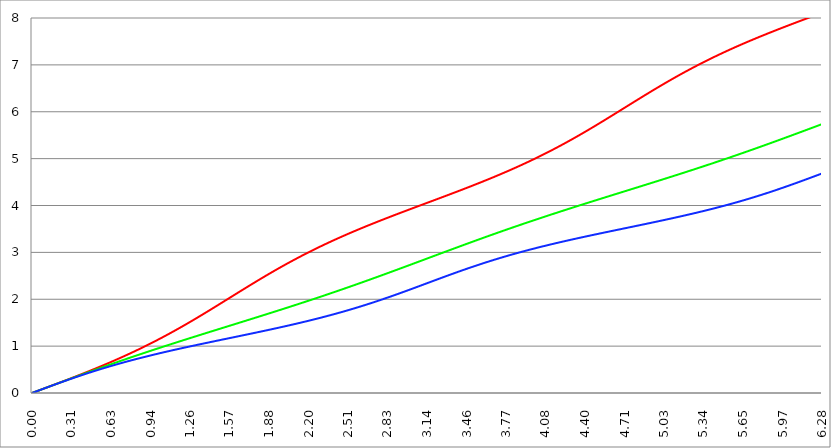
| Category | Series 1 | Series 0 | Series 2 |
|---|---|---|---|
| 0.0 | 0 | 0 | 0 |
| 0.00314159265358979 | 0.003 | 0.003 | 0.003 |
| 0.00628318530717958 | 0.006 | 0.006 | 0.006 |
| 0.00942477796076938 | 0.009 | 0.009 | 0.009 |
| 0.0125663706143592 | 0.013 | 0.013 | 0.013 |
| 0.015707963267949 | 0.016 | 0.016 | 0.016 |
| 0.0188495559215388 | 0.019 | 0.019 | 0.019 |
| 0.0219911485751285 | 0.022 | 0.022 | 0.022 |
| 0.0251327412287183 | 0.025 | 0.025 | 0.025 |
| 0.0282743338823081 | 0.028 | 0.028 | 0.028 |
| 0.0314159265358979 | 0.031 | 0.031 | 0.031 |
| 0.0345575191894877 | 0.035 | 0.035 | 0.035 |
| 0.0376991118430775 | 0.038 | 0.038 | 0.038 |
| 0.0408407044966673 | 0.041 | 0.041 | 0.041 |
| 0.0439822971502571 | 0.044 | 0.044 | 0.044 |
| 0.0471238898038469 | 0.047 | 0.047 | 0.047 |
| 0.0502654824574367 | 0.05 | 0.05 | 0.05 |
| 0.0534070751110265 | 0.053 | 0.053 | 0.053 |
| 0.0565486677646163 | 0.057 | 0.057 | 0.057 |
| 0.059690260418206 | 0.06 | 0.06 | 0.06 |
| 0.0628318530717958 | 0.063 | 0.063 | 0.063 |
| 0.0659734457253856 | 0.066 | 0.066 | 0.066 |
| 0.0691150383789754 | 0.069 | 0.069 | 0.069 |
| 0.0722566310325652 | 0.072 | 0.072 | 0.072 |
| 0.075398223686155 | 0.075 | 0.075 | 0.075 |
| 0.0785398163397448 | 0.079 | 0.079 | 0.078 |
| 0.0816814089933346 | 0.082 | 0.082 | 0.082 |
| 0.0848230016469244 | 0.085 | 0.085 | 0.085 |
| 0.0879645943005142 | 0.088 | 0.088 | 0.088 |
| 0.091106186954104 | 0.091 | 0.091 | 0.091 |
| 0.0942477796076937 | 0.094 | 0.094 | 0.094 |
| 0.0973893722612835 | 0.098 | 0.097 | 0.097 |
| 0.100530964914873 | 0.101 | 0.1 | 0.1 |
| 0.103672557568463 | 0.104 | 0.104 | 0.103 |
| 0.106814150222053 | 0.107 | 0.107 | 0.106 |
| 0.109955742875643 | 0.11 | 0.11 | 0.11 |
| 0.113097335529233 | 0.113 | 0.113 | 0.113 |
| 0.116238928182822 | 0.116 | 0.116 | 0.116 |
| 0.119380520836412 | 0.12 | 0.119 | 0.119 |
| 0.122522113490002 | 0.123 | 0.122 | 0.122 |
| 0.125663706143592 | 0.126 | 0.126 | 0.125 |
| 0.128805298797181 | 0.129 | 0.129 | 0.128 |
| 0.131946891450771 | 0.132 | 0.132 | 0.131 |
| 0.135088484104361 | 0.135 | 0.135 | 0.134 |
| 0.138230076757951 | 0.139 | 0.138 | 0.138 |
| 0.141371669411541 | 0.142 | 0.141 | 0.141 |
| 0.14451326206513 | 0.145 | 0.144 | 0.144 |
| 0.14765485471872 | 0.148 | 0.147 | 0.147 |
| 0.15079644737231 | 0.151 | 0.151 | 0.15 |
| 0.1539380400259 | 0.154 | 0.154 | 0.153 |
| 0.15707963267949 | 0.158 | 0.157 | 0.156 |
| 0.160221225333079 | 0.161 | 0.16 | 0.159 |
| 0.163362817986669 | 0.164 | 0.163 | 0.162 |
| 0.166504410640259 | 0.167 | 0.166 | 0.165 |
| 0.169646003293849 | 0.17 | 0.169 | 0.168 |
| 0.172787595947439 | 0.173 | 0.172 | 0.171 |
| 0.175929188601028 | 0.177 | 0.176 | 0.175 |
| 0.179070781254618 | 0.18 | 0.179 | 0.178 |
| 0.182212373908208 | 0.183 | 0.182 | 0.181 |
| 0.185353966561798 | 0.186 | 0.185 | 0.184 |
| 0.188495559215388 | 0.189 | 0.188 | 0.187 |
| 0.191637151868977 | 0.193 | 0.191 | 0.19 |
| 0.194778744522567 | 0.196 | 0.194 | 0.193 |
| 0.197920337176157 | 0.199 | 0.197 | 0.196 |
| 0.201061929829747 | 0.202 | 0.201 | 0.199 |
| 0.204203522483336 | 0.205 | 0.204 | 0.202 |
| 0.207345115136926 | 0.209 | 0.207 | 0.205 |
| 0.210486707790516 | 0.212 | 0.21 | 0.208 |
| 0.213628300444106 | 0.215 | 0.213 | 0.211 |
| 0.216769893097696 | 0.218 | 0.216 | 0.214 |
| 0.219911485751285 | 0.221 | 0.219 | 0.217 |
| 0.223053078404875 | 0.225 | 0.222 | 0.22 |
| 0.226194671058465 | 0.228 | 0.225 | 0.223 |
| 0.229336263712055 | 0.231 | 0.229 | 0.226 |
| 0.232477856365645 | 0.234 | 0.232 | 0.229 |
| 0.235619449019234 | 0.237 | 0.235 | 0.232 |
| 0.238761041672824 | 0.241 | 0.238 | 0.235 |
| 0.241902634326414 | 0.244 | 0.241 | 0.238 |
| 0.245044226980004 | 0.247 | 0.244 | 0.241 |
| 0.248185819633594 | 0.25 | 0.247 | 0.244 |
| 0.251327412287183 | 0.253 | 0.25 | 0.247 |
| 0.254469004940773 | 0.257 | 0.253 | 0.25 |
| 0.257610597594363 | 0.26 | 0.256 | 0.253 |
| 0.260752190247953 | 0.263 | 0.26 | 0.256 |
| 0.263893782901543 | 0.266 | 0.263 | 0.259 |
| 0.267035375555132 | 0.27 | 0.266 | 0.262 |
| 0.270176968208722 | 0.273 | 0.269 | 0.265 |
| 0.273318560862312 | 0.276 | 0.272 | 0.268 |
| 0.276460153515902 | 0.279 | 0.275 | 0.271 |
| 0.279601746169492 | 0.283 | 0.278 | 0.274 |
| 0.282743338823082 | 0.286 | 0.281 | 0.277 |
| 0.285884931476671 | 0.289 | 0.284 | 0.28 |
| 0.289026524130261 | 0.292 | 0.287 | 0.283 |
| 0.292168116783851 | 0.296 | 0.291 | 0.286 |
| 0.295309709437441 | 0.299 | 0.294 | 0.289 |
| 0.298451302091031 | 0.302 | 0.297 | 0.292 |
| 0.30159289474462 | 0.305 | 0.3 | 0.295 |
| 0.30473448739821 | 0.309 | 0.303 | 0.298 |
| 0.3078760800518 | 0.312 | 0.306 | 0.301 |
| 0.31101767270539 | 0.315 | 0.309 | 0.303 |
| 0.31415926535898 | 0.318 | 0.312 | 0.306 |
| 0.31730085801257 | 0.322 | 0.315 | 0.309 |
| 0.320442450666159 | 0.325 | 0.318 | 0.312 |
| 0.323584043319749 | 0.328 | 0.321 | 0.315 |
| 0.326725635973339 | 0.331 | 0.324 | 0.318 |
| 0.329867228626929 | 0.335 | 0.328 | 0.321 |
| 0.333008821280519 | 0.338 | 0.331 | 0.324 |
| 0.336150413934108 | 0.341 | 0.334 | 0.327 |
| 0.339292006587698 | 0.345 | 0.337 | 0.33 |
| 0.342433599241288 | 0.348 | 0.34 | 0.333 |
| 0.345575191894878 | 0.351 | 0.343 | 0.335 |
| 0.348716784548468 | 0.354 | 0.346 | 0.338 |
| 0.351858377202058 | 0.358 | 0.349 | 0.341 |
| 0.354999969855647 | 0.361 | 0.352 | 0.344 |
| 0.358141562509237 | 0.364 | 0.355 | 0.347 |
| 0.361283155162827 | 0.368 | 0.358 | 0.35 |
| 0.364424747816417 | 0.371 | 0.361 | 0.353 |
| 0.367566340470007 | 0.374 | 0.364 | 0.355 |
| 0.370707933123597 | 0.378 | 0.367 | 0.358 |
| 0.373849525777186 | 0.381 | 0.371 | 0.361 |
| 0.376991118430776 | 0.384 | 0.374 | 0.364 |
| 0.380132711084366 | 0.387 | 0.377 | 0.367 |
| 0.383274303737956 | 0.391 | 0.38 | 0.37 |
| 0.386415896391546 | 0.394 | 0.383 | 0.372 |
| 0.389557489045135 | 0.397 | 0.386 | 0.375 |
| 0.392699081698725 | 0.401 | 0.389 | 0.378 |
| 0.395840674352315 | 0.404 | 0.392 | 0.381 |
| 0.398982267005905 | 0.407 | 0.395 | 0.384 |
| 0.402123859659495 | 0.411 | 0.398 | 0.386 |
| 0.405265452313085 | 0.414 | 0.401 | 0.389 |
| 0.408407044966674 | 0.418 | 0.404 | 0.392 |
| 0.411548637620264 | 0.421 | 0.407 | 0.395 |
| 0.414690230273854 | 0.424 | 0.41 | 0.398 |
| 0.417831822927444 | 0.428 | 0.413 | 0.4 |
| 0.420973415581034 | 0.431 | 0.416 | 0.403 |
| 0.424115008234623 | 0.434 | 0.419 | 0.406 |
| 0.427256600888213 | 0.438 | 0.422 | 0.409 |
| 0.430398193541803 | 0.441 | 0.425 | 0.411 |
| 0.433539786195393 | 0.444 | 0.428 | 0.414 |
| 0.436681378848983 | 0.448 | 0.431 | 0.417 |
| 0.439822971502573 | 0.451 | 0.434 | 0.42 |
| 0.442964564156162 | 0.455 | 0.438 | 0.422 |
| 0.446106156809752 | 0.458 | 0.441 | 0.425 |
| 0.449247749463342 | 0.461 | 0.444 | 0.428 |
| 0.452389342116932 | 0.465 | 0.447 | 0.431 |
| 0.455530934770522 | 0.468 | 0.45 | 0.433 |
| 0.458672527424111 | 0.472 | 0.453 | 0.436 |
| 0.461814120077701 | 0.475 | 0.456 | 0.439 |
| 0.464955712731291 | 0.478 | 0.459 | 0.442 |
| 0.468097305384881 | 0.482 | 0.462 | 0.444 |
| 0.471238898038471 | 0.485 | 0.465 | 0.447 |
| 0.474380490692061 | 0.489 | 0.468 | 0.45 |
| 0.47752208334565 | 0.492 | 0.471 | 0.452 |
| 0.48066367599924 | 0.496 | 0.474 | 0.455 |
| 0.48380526865283 | 0.499 | 0.477 | 0.458 |
| 0.48694686130642 | 0.502 | 0.48 | 0.46 |
| 0.49008845396001 | 0.506 | 0.483 | 0.463 |
| 0.493230046613599 | 0.509 | 0.486 | 0.466 |
| 0.496371639267189 | 0.513 | 0.489 | 0.468 |
| 0.499513231920779 | 0.516 | 0.492 | 0.471 |
| 0.502654824574369 | 0.52 | 0.495 | 0.474 |
| 0.505796417227959 | 0.523 | 0.498 | 0.476 |
| 0.508938009881549 | 0.527 | 0.501 | 0.479 |
| 0.512079602535138 | 0.53 | 0.504 | 0.482 |
| 0.515221195188728 | 0.534 | 0.507 | 0.484 |
| 0.518362787842318 | 0.537 | 0.51 | 0.487 |
| 0.521504380495908 | 0.541 | 0.513 | 0.489 |
| 0.524645973149498 | 0.544 | 0.516 | 0.492 |
| 0.527787565803087 | 0.548 | 0.519 | 0.495 |
| 0.530929158456677 | 0.551 | 0.522 | 0.497 |
| 0.534070751110267 | 0.555 | 0.525 | 0.5 |
| 0.537212343763857 | 0.558 | 0.528 | 0.503 |
| 0.540353936417447 | 0.562 | 0.531 | 0.505 |
| 0.543495529071037 | 0.565 | 0.534 | 0.508 |
| 0.546637121724626 | 0.569 | 0.537 | 0.51 |
| 0.549778714378216 | 0.572 | 0.54 | 0.513 |
| 0.552920307031806 | 0.576 | 0.543 | 0.515 |
| 0.556061899685396 | 0.579 | 0.546 | 0.518 |
| 0.559203492338986 | 0.583 | 0.549 | 0.521 |
| 0.562345084992576 | 0.586 | 0.552 | 0.523 |
| 0.565486677646165 | 0.59 | 0.555 | 0.526 |
| 0.568628270299755 | 0.593 | 0.558 | 0.528 |
| 0.571769862953345 | 0.597 | 0.56 | 0.531 |
| 0.574911455606935 | 0.601 | 0.563 | 0.533 |
| 0.578053048260525 | 0.604 | 0.566 | 0.536 |
| 0.581194640914114 | 0.608 | 0.569 | 0.538 |
| 0.584336233567704 | 0.611 | 0.572 | 0.541 |
| 0.587477826221294 | 0.615 | 0.575 | 0.543 |
| 0.590619418874884 | 0.618 | 0.578 | 0.546 |
| 0.593761011528474 | 0.622 | 0.581 | 0.549 |
| 0.596902604182064 | 0.626 | 0.584 | 0.551 |
| 0.600044196835653 | 0.629 | 0.587 | 0.554 |
| 0.603185789489243 | 0.633 | 0.59 | 0.556 |
| 0.606327382142833 | 0.636 | 0.593 | 0.559 |
| 0.609468974796423 | 0.64 | 0.596 | 0.561 |
| 0.612610567450013 | 0.644 | 0.599 | 0.564 |
| 0.615752160103602 | 0.647 | 0.602 | 0.566 |
| 0.618893752757192 | 0.651 | 0.605 | 0.568 |
| 0.622035345410782 | 0.654 | 0.608 | 0.571 |
| 0.625176938064372 | 0.658 | 0.611 | 0.573 |
| 0.628318530717962 | 0.662 | 0.614 | 0.576 |
| 0.631460123371551 | 0.665 | 0.617 | 0.578 |
| 0.634601716025141 | 0.669 | 0.62 | 0.581 |
| 0.637743308678731 | 0.673 | 0.622 | 0.583 |
| 0.640884901332321 | 0.676 | 0.625 | 0.586 |
| 0.644026493985911 | 0.68 | 0.628 | 0.588 |
| 0.647168086639501 | 0.684 | 0.631 | 0.591 |
| 0.65030967929309 | 0.687 | 0.634 | 0.593 |
| 0.65345127194668 | 0.691 | 0.637 | 0.595 |
| 0.65659286460027 | 0.695 | 0.64 | 0.598 |
| 0.65973445725386 | 0.698 | 0.643 | 0.6 |
| 0.66287604990745 | 0.702 | 0.646 | 0.603 |
| 0.666017642561039 | 0.706 | 0.649 | 0.605 |
| 0.669159235214629 | 0.71 | 0.652 | 0.607 |
| 0.672300827868219 | 0.713 | 0.655 | 0.61 |
| 0.675442420521809 | 0.717 | 0.658 | 0.612 |
| 0.678584013175399 | 0.721 | 0.66 | 0.615 |
| 0.681725605828989 | 0.724 | 0.663 | 0.617 |
| 0.684867198482578 | 0.728 | 0.666 | 0.619 |
| 0.688008791136168 | 0.732 | 0.669 | 0.622 |
| 0.691150383789758 | 0.736 | 0.672 | 0.624 |
| 0.694291976443348 | 0.739 | 0.675 | 0.627 |
| 0.697433569096938 | 0.743 | 0.678 | 0.629 |
| 0.700575161750528 | 0.747 | 0.681 | 0.631 |
| 0.703716754404117 | 0.751 | 0.684 | 0.634 |
| 0.706858347057707 | 0.755 | 0.687 | 0.636 |
| 0.709999939711297 | 0.758 | 0.69 | 0.638 |
| 0.713141532364887 | 0.762 | 0.692 | 0.641 |
| 0.716283125018477 | 0.766 | 0.695 | 0.643 |
| 0.719424717672066 | 0.77 | 0.698 | 0.645 |
| 0.722566310325656 | 0.774 | 0.701 | 0.648 |
| 0.725707902979246 | 0.777 | 0.704 | 0.65 |
| 0.728849495632836 | 0.781 | 0.707 | 0.652 |
| 0.731991088286426 | 0.785 | 0.71 | 0.655 |
| 0.735132680940016 | 0.789 | 0.713 | 0.657 |
| 0.738274273593605 | 0.793 | 0.715 | 0.659 |
| 0.741415866247195 | 0.796 | 0.718 | 0.662 |
| 0.744557458900785 | 0.8 | 0.721 | 0.664 |
| 0.747699051554375 | 0.804 | 0.724 | 0.666 |
| 0.750840644207965 | 0.808 | 0.727 | 0.668 |
| 0.753982236861554 | 0.812 | 0.73 | 0.671 |
| 0.757123829515144 | 0.816 | 0.733 | 0.673 |
| 0.760265422168734 | 0.82 | 0.736 | 0.675 |
| 0.763407014822324 | 0.824 | 0.738 | 0.678 |
| 0.766548607475914 | 0.827 | 0.741 | 0.68 |
| 0.769690200129504 | 0.831 | 0.744 | 0.682 |
| 0.772831792783093 | 0.835 | 0.747 | 0.684 |
| 0.775973385436683 | 0.839 | 0.75 | 0.687 |
| 0.779114978090273 | 0.843 | 0.753 | 0.689 |
| 0.782256570743863 | 0.847 | 0.756 | 0.691 |
| 0.785398163397453 | 0.851 | 0.759 | 0.693 |
| 0.788539756051042 | 0.855 | 0.761 | 0.696 |
| 0.791681348704632 | 0.859 | 0.764 | 0.698 |
| 0.794822941358222 | 0.863 | 0.767 | 0.7 |
| 0.797964534011812 | 0.867 | 0.77 | 0.702 |
| 0.801106126665402 | 0.871 | 0.773 | 0.705 |
| 0.804247719318992 | 0.875 | 0.776 | 0.707 |
| 0.807389311972581 | 0.878 | 0.778 | 0.709 |
| 0.810530904626171 | 0.882 | 0.781 | 0.711 |
| 0.813672497279761 | 0.886 | 0.784 | 0.713 |
| 0.816814089933351 | 0.89 | 0.787 | 0.716 |
| 0.819955682586941 | 0.894 | 0.79 | 0.718 |
| 0.823097275240531 | 0.898 | 0.793 | 0.72 |
| 0.82623886789412 | 0.902 | 0.796 | 0.722 |
| 0.82938046054771 | 0.906 | 0.798 | 0.724 |
| 0.8325220532013 | 0.91 | 0.801 | 0.727 |
| 0.83566364585489 | 0.914 | 0.804 | 0.729 |
| 0.83880523850848 | 0.919 | 0.807 | 0.731 |
| 0.841946831162069 | 0.923 | 0.81 | 0.733 |
| 0.845088423815659 | 0.927 | 0.812 | 0.735 |
| 0.848230016469249 | 0.931 | 0.815 | 0.737 |
| 0.851371609122839 | 0.935 | 0.818 | 0.74 |
| 0.854513201776429 | 0.939 | 0.821 | 0.742 |
| 0.857654794430019 | 0.943 | 0.824 | 0.744 |
| 0.860796387083608 | 0.947 | 0.827 | 0.746 |
| 0.863937979737198 | 0.951 | 0.829 | 0.748 |
| 0.867079572390788 | 0.955 | 0.832 | 0.75 |
| 0.870221165044378 | 0.959 | 0.835 | 0.753 |
| 0.873362757697968 | 0.963 | 0.838 | 0.755 |
| 0.876504350351557 | 0.967 | 0.841 | 0.757 |
| 0.879645943005147 | 0.972 | 0.843 | 0.759 |
| 0.882787535658737 | 0.976 | 0.846 | 0.761 |
| 0.885929128312327 | 0.98 | 0.849 | 0.763 |
| 0.889070720965917 | 0.984 | 0.852 | 0.765 |
| 0.892212313619507 | 0.988 | 0.855 | 0.767 |
| 0.895353906273096 | 0.992 | 0.857 | 0.77 |
| 0.898495498926686 | 0.996 | 0.86 | 0.772 |
| 0.901637091580276 | 1.001 | 0.863 | 0.774 |
| 0.904778684233866 | 1.005 | 0.866 | 0.776 |
| 0.907920276887456 | 1.009 | 0.869 | 0.778 |
| 0.911061869541045 | 1.013 | 0.871 | 0.78 |
| 0.914203462194635 | 1.017 | 0.874 | 0.782 |
| 0.917345054848225 | 1.021 | 0.877 | 0.784 |
| 0.920486647501815 | 1.026 | 0.88 | 0.786 |
| 0.923628240155405 | 1.03 | 0.883 | 0.788 |
| 0.926769832808995 | 1.034 | 0.885 | 0.791 |
| 0.929911425462584 | 1.038 | 0.888 | 0.793 |
| 0.933053018116174 | 1.043 | 0.891 | 0.795 |
| 0.936194610769764 | 1.047 | 0.894 | 0.797 |
| 0.939336203423354 | 1.051 | 0.897 | 0.799 |
| 0.942477796076944 | 1.055 | 0.899 | 0.801 |
| 0.945619388730533 | 1.06 | 0.902 | 0.803 |
| 0.948760981384123 | 1.064 | 0.905 | 0.805 |
| 0.951902574037713 | 1.068 | 0.908 | 0.807 |
| 0.955044166691303 | 1.072 | 0.91 | 0.809 |
| 0.958185759344893 | 1.077 | 0.913 | 0.811 |
| 0.961327351998483 | 1.081 | 0.916 | 0.813 |
| 0.964468944652072 | 1.085 | 0.919 | 0.815 |
| 0.967610537305662 | 1.09 | 0.922 | 0.817 |
| 0.970752129959252 | 1.094 | 0.924 | 0.819 |
| 0.973893722612842 | 1.098 | 0.927 | 0.821 |
| 0.977035315266432 | 1.102 | 0.93 | 0.823 |
| 0.980176907920022 | 1.107 | 0.933 | 0.825 |
| 0.983318500573611 | 1.111 | 0.935 | 0.827 |
| 0.986460093227201 | 1.116 | 0.938 | 0.829 |
| 0.989601685880791 | 1.12 | 0.941 | 0.831 |
| 0.992743278534381 | 1.124 | 0.944 | 0.833 |
| 0.995884871187971 | 1.129 | 0.946 | 0.835 |
| 0.99902646384156 | 1.133 | 0.949 | 0.837 |
| 1.00216805649515 | 1.137 | 0.952 | 0.839 |
| 1.00530964914874 | 1.142 | 0.955 | 0.841 |
| 1.00845124180233 | 1.146 | 0.957 | 0.843 |
| 1.01159283445592 | 1.151 | 0.96 | 0.845 |
| 1.01473442710951 | 1.155 | 0.963 | 0.847 |
| 1.017876019763099 | 1.159 | 0.966 | 0.849 |
| 1.021017612416689 | 1.164 | 0.968 | 0.851 |
| 1.02415920507028 | 1.168 | 0.971 | 0.853 |
| 1.027300797723869 | 1.173 | 0.974 | 0.855 |
| 1.030442390377459 | 1.177 | 0.977 | 0.857 |
| 1.033583983031048 | 1.182 | 0.979 | 0.859 |
| 1.036725575684638 | 1.186 | 0.982 | 0.861 |
| 1.039867168338228 | 1.191 | 0.985 | 0.863 |
| 1.043008760991818 | 1.195 | 0.988 | 0.865 |
| 1.046150353645408 | 1.199 | 0.99 | 0.867 |
| 1.049291946298998 | 1.204 | 0.993 | 0.869 |
| 1.052433538952587 | 1.208 | 0.996 | 0.871 |
| 1.055575131606177 | 1.213 | 0.998 | 0.873 |
| 1.058716724259767 | 1.217 | 1.001 | 0.875 |
| 1.061858316913357 | 1.222 | 1.004 | 0.877 |
| 1.064999909566947 | 1.227 | 1.007 | 0.879 |
| 1.068141502220536 | 1.231 | 1.009 | 0.881 |
| 1.071283094874126 | 1.236 | 1.012 | 0.883 |
| 1.074424687527716 | 1.24 | 1.015 | 0.885 |
| 1.077566280181306 | 1.245 | 1.017 | 0.887 |
| 1.080707872834896 | 1.249 | 1.02 | 0.889 |
| 1.083849465488486 | 1.254 | 1.023 | 0.891 |
| 1.086991058142075 | 1.258 | 1.026 | 0.893 |
| 1.090132650795665 | 1.263 | 1.028 | 0.894 |
| 1.093274243449255 | 1.268 | 1.031 | 0.896 |
| 1.096415836102845 | 1.272 | 1.034 | 0.898 |
| 1.099557428756435 | 1.277 | 1.037 | 0.9 |
| 1.102699021410025 | 1.281 | 1.039 | 0.902 |
| 1.105840614063614 | 1.286 | 1.042 | 0.904 |
| 1.108982206717204 | 1.291 | 1.045 | 0.906 |
| 1.112123799370794 | 1.295 | 1.047 | 0.908 |
| 1.115265392024384 | 1.3 | 1.05 | 0.91 |
| 1.118406984677974 | 1.304 | 1.053 | 0.912 |
| 1.121548577331563 | 1.309 | 1.055 | 0.914 |
| 1.124690169985153 | 1.314 | 1.058 | 0.916 |
| 1.127831762638743 | 1.318 | 1.061 | 0.917 |
| 1.130973355292333 | 1.323 | 1.064 | 0.919 |
| 1.134114947945923 | 1.328 | 1.066 | 0.921 |
| 1.137256540599513 | 1.332 | 1.069 | 0.923 |
| 1.140398133253102 | 1.337 | 1.072 | 0.925 |
| 1.143539725906692 | 1.342 | 1.074 | 0.927 |
| 1.146681318560282 | 1.347 | 1.077 | 0.929 |
| 1.149822911213872 | 1.351 | 1.08 | 0.931 |
| 1.152964503867462 | 1.356 | 1.082 | 0.933 |
| 1.156106096521051 | 1.361 | 1.085 | 0.934 |
| 1.159247689174641 | 1.365 | 1.088 | 0.936 |
| 1.162389281828231 | 1.37 | 1.09 | 0.938 |
| 1.165530874481821 | 1.375 | 1.093 | 0.94 |
| 1.168672467135411 | 1.38 | 1.096 | 0.942 |
| 1.171814059789001 | 1.384 | 1.099 | 0.944 |
| 1.17495565244259 | 1.389 | 1.101 | 0.946 |
| 1.17809724509618 | 1.394 | 1.104 | 0.948 |
| 1.18123883774977 | 1.399 | 1.107 | 0.949 |
| 1.18438043040336 | 1.403 | 1.109 | 0.951 |
| 1.18752202305695 | 1.408 | 1.112 | 0.953 |
| 1.190663615710539 | 1.413 | 1.115 | 0.955 |
| 1.193805208364129 | 1.418 | 1.117 | 0.957 |
| 1.19694680101772 | 1.423 | 1.12 | 0.959 |
| 1.200088393671309 | 1.427 | 1.123 | 0.961 |
| 1.203229986324899 | 1.432 | 1.125 | 0.962 |
| 1.206371578978489 | 1.437 | 1.128 | 0.964 |
| 1.209513171632078 | 1.442 | 1.131 | 0.966 |
| 1.212654764285668 | 1.447 | 1.133 | 0.968 |
| 1.215796356939258 | 1.452 | 1.136 | 0.97 |
| 1.218937949592848 | 1.456 | 1.139 | 0.972 |
| 1.222079542246438 | 1.461 | 1.141 | 0.974 |
| 1.225221134900027 | 1.466 | 1.144 | 0.975 |
| 1.228362727553617 | 1.471 | 1.147 | 0.977 |
| 1.231504320207207 | 1.476 | 1.149 | 0.979 |
| 1.234645912860797 | 1.481 | 1.152 | 0.981 |
| 1.237787505514387 | 1.486 | 1.155 | 0.983 |
| 1.240929098167977 | 1.491 | 1.157 | 0.985 |
| 1.244070690821566 | 1.495 | 1.16 | 0.986 |
| 1.247212283475156 | 1.5 | 1.163 | 0.988 |
| 1.250353876128746 | 1.505 | 1.165 | 0.99 |
| 1.253495468782336 | 1.51 | 1.168 | 0.992 |
| 1.256637061435926 | 1.515 | 1.171 | 0.994 |
| 1.259778654089515 | 1.52 | 1.173 | 0.996 |
| 1.262920246743105 | 1.525 | 1.176 | 0.997 |
| 1.266061839396695 | 1.53 | 1.179 | 0.999 |
| 1.269203432050285 | 1.535 | 1.181 | 1.001 |
| 1.272345024703875 | 1.54 | 1.184 | 1.003 |
| 1.275486617357465 | 1.545 | 1.187 | 1.005 |
| 1.278628210011054 | 1.55 | 1.189 | 1.006 |
| 1.281769802664644 | 1.555 | 1.192 | 1.008 |
| 1.284911395318234 | 1.56 | 1.195 | 1.01 |
| 1.288052987971824 | 1.565 | 1.197 | 1.012 |
| 1.291194580625414 | 1.57 | 1.2 | 1.014 |
| 1.294336173279003 | 1.575 | 1.203 | 1.015 |
| 1.297477765932593 | 1.58 | 1.205 | 1.017 |
| 1.300619358586183 | 1.585 | 1.208 | 1.019 |
| 1.303760951239773 | 1.59 | 1.211 | 1.021 |
| 1.306902543893363 | 1.595 | 1.213 | 1.023 |
| 1.310044136546953 | 1.6 | 1.216 | 1.024 |
| 1.313185729200542 | 1.605 | 1.218 | 1.026 |
| 1.316327321854132 | 1.61 | 1.221 | 1.028 |
| 1.319468914507722 | 1.615 | 1.224 | 1.03 |
| 1.322610507161312 | 1.62 | 1.226 | 1.032 |
| 1.325752099814902 | 1.625 | 1.229 | 1.033 |
| 1.328893692468491 | 1.63 | 1.232 | 1.035 |
| 1.332035285122081 | 1.635 | 1.234 | 1.037 |
| 1.335176877775671 | 1.64 | 1.237 | 1.039 |
| 1.338318470429261 | 1.645 | 1.24 | 1.041 |
| 1.341460063082851 | 1.65 | 1.242 | 1.042 |
| 1.344601655736441 | 1.655 | 1.245 | 1.044 |
| 1.34774324839003 | 1.66 | 1.248 | 1.046 |
| 1.35088484104362 | 1.665 | 1.25 | 1.048 |
| 1.35402643369721 | 1.67 | 1.253 | 1.05 |
| 1.3571680263508 | 1.675 | 1.255 | 1.051 |
| 1.36030961900439 | 1.68 | 1.258 | 1.053 |
| 1.363451211657979 | 1.686 | 1.261 | 1.055 |
| 1.36659280431157 | 1.691 | 1.263 | 1.057 |
| 1.369734396965159 | 1.696 | 1.266 | 1.058 |
| 1.372875989618749 | 1.701 | 1.269 | 1.06 |
| 1.376017582272339 | 1.706 | 1.271 | 1.062 |
| 1.379159174925929 | 1.711 | 1.274 | 1.064 |
| 1.382300767579518 | 1.716 | 1.277 | 1.066 |
| 1.385442360233108 | 1.721 | 1.279 | 1.067 |
| 1.388583952886698 | 1.726 | 1.282 | 1.069 |
| 1.391725545540288 | 1.732 | 1.284 | 1.071 |
| 1.394867138193878 | 1.737 | 1.287 | 1.073 |
| 1.398008730847468 | 1.742 | 1.29 | 1.074 |
| 1.401150323501057 | 1.747 | 1.292 | 1.076 |
| 1.404291916154647 | 1.752 | 1.295 | 1.078 |
| 1.407433508808237 | 1.757 | 1.298 | 1.08 |
| 1.410575101461827 | 1.762 | 1.3 | 1.081 |
| 1.413716694115417 | 1.768 | 1.303 | 1.083 |
| 1.416858286769006 | 1.773 | 1.305 | 1.085 |
| 1.419999879422596 | 1.778 | 1.308 | 1.087 |
| 1.423141472076186 | 1.783 | 1.311 | 1.089 |
| 1.426283064729776 | 1.788 | 1.313 | 1.09 |
| 1.429424657383366 | 1.793 | 1.316 | 1.092 |
| 1.432566250036956 | 1.798 | 1.319 | 1.094 |
| 1.435707842690545 | 1.804 | 1.321 | 1.096 |
| 1.438849435344135 | 1.809 | 1.324 | 1.097 |
| 1.441991027997725 | 1.814 | 1.326 | 1.099 |
| 1.445132620651315 | 1.819 | 1.329 | 1.101 |
| 1.448274213304905 | 1.824 | 1.332 | 1.103 |
| 1.451415805958494 | 1.83 | 1.334 | 1.104 |
| 1.454557398612084 | 1.835 | 1.337 | 1.106 |
| 1.457698991265674 | 1.84 | 1.34 | 1.108 |
| 1.460840583919264 | 1.845 | 1.342 | 1.11 |
| 1.463982176572854 | 1.85 | 1.345 | 1.111 |
| 1.467123769226444 | 1.856 | 1.347 | 1.113 |
| 1.470265361880033 | 1.861 | 1.35 | 1.115 |
| 1.473406954533623 | 1.866 | 1.353 | 1.117 |
| 1.476548547187213 | 1.871 | 1.355 | 1.118 |
| 1.479690139840803 | 1.876 | 1.358 | 1.12 |
| 1.482831732494393 | 1.882 | 1.361 | 1.122 |
| 1.485973325147982 | 1.887 | 1.363 | 1.124 |
| 1.489114917801572 | 1.892 | 1.366 | 1.125 |
| 1.492256510455162 | 1.897 | 1.368 | 1.127 |
| 1.495398103108752 | 1.902 | 1.371 | 1.129 |
| 1.498539695762342 | 1.908 | 1.374 | 1.131 |
| 1.501681288415932 | 1.913 | 1.376 | 1.132 |
| 1.504822881069521 | 1.918 | 1.379 | 1.134 |
| 1.507964473723111 | 1.923 | 1.382 | 1.136 |
| 1.511106066376701 | 1.928 | 1.384 | 1.138 |
| 1.514247659030291 | 1.934 | 1.387 | 1.139 |
| 1.517389251683881 | 1.939 | 1.389 | 1.141 |
| 1.520530844337471 | 1.944 | 1.392 | 1.143 |
| 1.52367243699106 | 1.949 | 1.395 | 1.145 |
| 1.52681402964465 | 1.955 | 1.397 | 1.146 |
| 1.52995562229824 | 1.96 | 1.4 | 1.148 |
| 1.53309721495183 | 1.965 | 1.403 | 1.15 |
| 1.53623880760542 | 1.97 | 1.405 | 1.152 |
| 1.539380400259009 | 1.976 | 1.408 | 1.153 |
| 1.542521992912599 | 1.981 | 1.41 | 1.155 |
| 1.545663585566189 | 1.986 | 1.413 | 1.157 |
| 1.548805178219779 | 1.991 | 1.416 | 1.159 |
| 1.551946770873369 | 1.996 | 1.418 | 1.16 |
| 1.555088363526959 | 2.002 | 1.421 | 1.162 |
| 1.558229956180548 | 2.007 | 1.423 | 1.164 |
| 1.561371548834138 | 2.012 | 1.426 | 1.166 |
| 1.564513141487728 | 2.017 | 1.429 | 1.167 |
| 1.567654734141318 | 2.023 | 1.431 | 1.169 |
| 1.570796326794908 | 2.028 | 1.434 | 1.171 |
| 1.573937919448497 | 2.033 | 1.437 | 1.173 |
| 1.577079512102087 | 2.038 | 1.439 | 1.174 |
| 1.580221104755677 | 2.044 | 1.442 | 1.176 |
| 1.583362697409267 | 2.049 | 1.444 | 1.178 |
| 1.586504290062857 | 2.054 | 1.447 | 1.18 |
| 1.589645882716447 | 2.059 | 1.45 | 1.181 |
| 1.592787475370036 | 2.065 | 1.452 | 1.183 |
| 1.595929068023626 | 2.07 | 1.455 | 1.185 |
| 1.599070660677216 | 2.075 | 1.457 | 1.187 |
| 1.602212253330806 | 2.08 | 1.46 | 1.188 |
| 1.605353845984396 | 2.085 | 1.463 | 1.19 |
| 1.608495438637985 | 2.091 | 1.465 | 1.192 |
| 1.611637031291575 | 2.096 | 1.468 | 1.193 |
| 1.614778623945165 | 2.101 | 1.471 | 1.195 |
| 1.617920216598755 | 2.106 | 1.473 | 1.197 |
| 1.621061809252345 | 2.112 | 1.476 | 1.199 |
| 1.624203401905935 | 2.117 | 1.478 | 1.2 |
| 1.627344994559524 | 2.122 | 1.481 | 1.202 |
| 1.630486587213114 | 2.127 | 1.484 | 1.204 |
| 1.633628179866704 | 2.133 | 1.486 | 1.206 |
| 1.636769772520294 | 2.138 | 1.489 | 1.207 |
| 1.639911365173884 | 2.143 | 1.492 | 1.209 |
| 1.643052957827473 | 2.148 | 1.494 | 1.211 |
| 1.646194550481063 | 2.153 | 1.497 | 1.213 |
| 1.649336143134653 | 2.159 | 1.499 | 1.214 |
| 1.652477735788243 | 2.164 | 1.502 | 1.216 |
| 1.655619328441833 | 2.169 | 1.505 | 1.218 |
| 1.658760921095423 | 2.174 | 1.507 | 1.22 |
| 1.661902513749012 | 2.179 | 1.51 | 1.221 |
| 1.665044106402602 | 2.185 | 1.513 | 1.223 |
| 1.668185699056192 | 2.19 | 1.515 | 1.225 |
| 1.671327291709782 | 2.195 | 1.518 | 1.227 |
| 1.674468884363372 | 2.2 | 1.52 | 1.228 |
| 1.677610477016961 | 2.205 | 1.523 | 1.23 |
| 1.680752069670551 | 2.211 | 1.526 | 1.232 |
| 1.683893662324141 | 2.216 | 1.528 | 1.234 |
| 1.687035254977731 | 2.221 | 1.531 | 1.236 |
| 1.690176847631321 | 2.226 | 1.533 | 1.237 |
| 1.693318440284911 | 2.231 | 1.536 | 1.239 |
| 1.6964600329385 | 2.237 | 1.539 | 1.241 |
| 1.69960162559209 | 2.242 | 1.541 | 1.243 |
| 1.70274321824568 | 2.247 | 1.544 | 1.244 |
| 1.70588481089927 | 2.252 | 1.547 | 1.246 |
| 1.70902640355286 | 2.257 | 1.549 | 1.248 |
| 1.712167996206449 | 2.262 | 1.552 | 1.25 |
| 1.715309588860039 | 2.268 | 1.555 | 1.251 |
| 1.71845118151363 | 2.273 | 1.557 | 1.253 |
| 1.721592774167219 | 2.278 | 1.56 | 1.255 |
| 1.724734366820809 | 2.283 | 1.562 | 1.257 |
| 1.727875959474399 | 2.288 | 1.565 | 1.258 |
| 1.731017552127988 | 2.293 | 1.568 | 1.26 |
| 1.734159144781578 | 2.299 | 1.57 | 1.262 |
| 1.737300737435168 | 2.304 | 1.573 | 1.264 |
| 1.740442330088758 | 2.309 | 1.576 | 1.265 |
| 1.743583922742348 | 2.314 | 1.578 | 1.267 |
| 1.746725515395937 | 2.319 | 1.581 | 1.269 |
| 1.749867108049527 | 2.324 | 1.583 | 1.271 |
| 1.753008700703117 | 2.329 | 1.586 | 1.273 |
| 1.756150293356707 | 2.335 | 1.589 | 1.274 |
| 1.759291886010297 | 2.34 | 1.591 | 1.276 |
| 1.762433478663887 | 2.345 | 1.594 | 1.278 |
| 1.765575071317476 | 2.35 | 1.597 | 1.28 |
| 1.768716663971066 | 2.355 | 1.599 | 1.281 |
| 1.771858256624656 | 2.36 | 1.602 | 1.283 |
| 1.774999849278246 | 2.365 | 1.604 | 1.285 |
| 1.778141441931836 | 2.37 | 1.607 | 1.287 |
| 1.781283034585426 | 2.375 | 1.61 | 1.289 |
| 1.784424627239015 | 2.38 | 1.612 | 1.29 |
| 1.787566219892605 | 2.386 | 1.615 | 1.292 |
| 1.790707812546195 | 2.391 | 1.618 | 1.294 |
| 1.793849405199785 | 2.396 | 1.62 | 1.296 |
| 1.796990997853375 | 2.401 | 1.623 | 1.297 |
| 1.800132590506964 | 2.406 | 1.626 | 1.299 |
| 1.803274183160554 | 2.411 | 1.628 | 1.301 |
| 1.806415775814144 | 2.416 | 1.631 | 1.303 |
| 1.809557368467734 | 2.421 | 1.634 | 1.305 |
| 1.812698961121324 | 2.426 | 1.636 | 1.306 |
| 1.815840553774914 | 2.431 | 1.639 | 1.308 |
| 1.818982146428503 | 2.436 | 1.641 | 1.31 |
| 1.822123739082093 | 2.441 | 1.644 | 1.312 |
| 1.825265331735683 | 2.446 | 1.647 | 1.314 |
| 1.828406924389273 | 2.451 | 1.649 | 1.315 |
| 1.831548517042863 | 2.456 | 1.652 | 1.317 |
| 1.834690109696452 | 2.461 | 1.655 | 1.319 |
| 1.837831702350042 | 2.466 | 1.657 | 1.321 |
| 1.840973295003632 | 2.471 | 1.66 | 1.323 |
| 1.844114887657222 | 2.476 | 1.663 | 1.324 |
| 1.847256480310812 | 2.481 | 1.665 | 1.326 |
| 1.850398072964402 | 2.486 | 1.668 | 1.328 |
| 1.853539665617991 | 2.491 | 1.671 | 1.33 |
| 1.856681258271581 | 2.496 | 1.673 | 1.332 |
| 1.859822850925171 | 2.501 | 1.676 | 1.333 |
| 1.862964443578761 | 2.506 | 1.679 | 1.335 |
| 1.866106036232351 | 2.511 | 1.681 | 1.337 |
| 1.86924762888594 | 2.516 | 1.684 | 1.339 |
| 1.87238922153953 | 2.521 | 1.687 | 1.341 |
| 1.87553081419312 | 2.526 | 1.689 | 1.342 |
| 1.87867240684671 | 2.531 | 1.692 | 1.344 |
| 1.8818139995003 | 2.536 | 1.694 | 1.346 |
| 1.88495559215389 | 2.541 | 1.697 | 1.348 |
| 1.888097184807479 | 2.546 | 1.7 | 1.35 |
| 1.891238777461069 | 2.55 | 1.702 | 1.352 |
| 1.89438037011466 | 2.555 | 1.705 | 1.353 |
| 1.897521962768249 | 2.56 | 1.708 | 1.355 |
| 1.900663555421839 | 2.565 | 1.71 | 1.357 |
| 1.903805148075429 | 2.57 | 1.713 | 1.359 |
| 1.906946740729018 | 2.575 | 1.716 | 1.361 |
| 1.910088333382608 | 2.58 | 1.718 | 1.363 |
| 1.913229926036198 | 2.585 | 1.721 | 1.364 |
| 1.916371518689788 | 2.59 | 1.724 | 1.366 |
| 1.919513111343378 | 2.594 | 1.726 | 1.368 |
| 1.922654703996967 | 2.599 | 1.729 | 1.37 |
| 1.925796296650557 | 2.604 | 1.732 | 1.372 |
| 1.928937889304147 | 2.609 | 1.734 | 1.374 |
| 1.932079481957737 | 2.614 | 1.737 | 1.375 |
| 1.935221074611327 | 2.619 | 1.74 | 1.377 |
| 1.938362667264917 | 2.623 | 1.743 | 1.379 |
| 1.941504259918506 | 2.628 | 1.745 | 1.381 |
| 1.944645852572096 | 2.633 | 1.748 | 1.383 |
| 1.947787445225686 | 2.638 | 1.751 | 1.385 |
| 1.950929037879276 | 2.643 | 1.753 | 1.387 |
| 1.954070630532866 | 2.648 | 1.756 | 1.388 |
| 1.957212223186455 | 2.652 | 1.759 | 1.39 |
| 1.960353815840045 | 2.657 | 1.761 | 1.392 |
| 1.963495408493635 | 2.662 | 1.764 | 1.394 |
| 1.966637001147225 | 2.667 | 1.767 | 1.396 |
| 1.969778593800815 | 2.671 | 1.769 | 1.398 |
| 1.972920186454405 | 2.676 | 1.772 | 1.4 |
| 1.976061779107994 | 2.681 | 1.775 | 1.401 |
| 1.979203371761584 | 2.686 | 1.777 | 1.403 |
| 1.982344964415174 | 2.69 | 1.78 | 1.405 |
| 1.985486557068764 | 2.695 | 1.783 | 1.407 |
| 1.988628149722354 | 2.7 | 1.785 | 1.409 |
| 1.991769742375943 | 2.705 | 1.788 | 1.411 |
| 1.994911335029533 | 2.709 | 1.791 | 1.413 |
| 1.998052927683123 | 2.714 | 1.794 | 1.415 |
| 2.001194520336712 | 2.719 | 1.796 | 1.417 |
| 2.004336112990302 | 2.723 | 1.799 | 1.418 |
| 2.007477705643892 | 2.728 | 1.802 | 1.42 |
| 2.010619298297482 | 2.733 | 1.804 | 1.422 |
| 2.013760890951071 | 2.737 | 1.807 | 1.424 |
| 2.016902483604661 | 2.742 | 1.81 | 1.426 |
| 2.02004407625825 | 2.747 | 1.812 | 1.428 |
| 2.02318566891184 | 2.751 | 1.815 | 1.43 |
| 2.02632726156543 | 2.756 | 1.818 | 1.432 |
| 2.029468854219019 | 2.761 | 1.821 | 1.434 |
| 2.032610446872609 | 2.765 | 1.823 | 1.436 |
| 2.035752039526198 | 2.77 | 1.826 | 1.437 |
| 2.038893632179788 | 2.774 | 1.829 | 1.439 |
| 2.042035224833378 | 2.779 | 1.831 | 1.441 |
| 2.045176817486967 | 2.784 | 1.834 | 1.443 |
| 2.048318410140557 | 2.788 | 1.837 | 1.445 |
| 2.051460002794146 | 2.793 | 1.84 | 1.447 |
| 2.054601595447736 | 2.797 | 1.842 | 1.449 |
| 2.057743188101325 | 2.802 | 1.845 | 1.451 |
| 2.060884780754915 | 2.807 | 1.848 | 1.453 |
| 2.064026373408505 | 2.811 | 1.85 | 1.455 |
| 2.067167966062094 | 2.816 | 1.853 | 1.457 |
| 2.070309558715684 | 2.82 | 1.856 | 1.459 |
| 2.073451151369273 | 2.825 | 1.859 | 1.461 |
| 2.076592744022863 | 2.829 | 1.861 | 1.463 |
| 2.079734336676452 | 2.834 | 1.864 | 1.465 |
| 2.082875929330042 | 2.838 | 1.867 | 1.467 |
| 2.086017521983632 | 2.843 | 1.869 | 1.468 |
| 2.089159114637221 | 2.847 | 1.872 | 1.47 |
| 2.092300707290811 | 2.852 | 1.875 | 1.472 |
| 2.095442299944401 | 2.856 | 1.878 | 1.474 |
| 2.09858389259799 | 2.861 | 1.88 | 1.476 |
| 2.10172548525158 | 2.865 | 1.883 | 1.478 |
| 2.104867077905169 | 2.87 | 1.886 | 1.48 |
| 2.108008670558759 | 2.874 | 1.889 | 1.482 |
| 2.111150263212349 | 2.879 | 1.891 | 1.484 |
| 2.114291855865938 | 2.883 | 1.894 | 1.486 |
| 2.117433448519528 | 2.888 | 1.897 | 1.488 |
| 2.120575041173117 | 2.892 | 1.9 | 1.49 |
| 2.123716633826707 | 2.896 | 1.902 | 1.492 |
| 2.126858226480297 | 2.901 | 1.905 | 1.494 |
| 2.129999819133886 | 2.905 | 1.908 | 1.496 |
| 2.133141411787476 | 2.91 | 1.911 | 1.498 |
| 2.136283004441065 | 2.914 | 1.913 | 1.5 |
| 2.139424597094655 | 2.918 | 1.916 | 1.502 |
| 2.142566189748245 | 2.923 | 1.919 | 1.504 |
| 2.145707782401834 | 2.927 | 1.922 | 1.506 |
| 2.148849375055424 | 2.932 | 1.924 | 1.508 |
| 2.151990967709013 | 2.936 | 1.927 | 1.51 |
| 2.155132560362603 | 2.94 | 1.93 | 1.512 |
| 2.158274153016193 | 2.945 | 1.933 | 1.514 |
| 2.161415745669782 | 2.949 | 1.935 | 1.516 |
| 2.164557338323372 | 2.953 | 1.938 | 1.518 |
| 2.167698930976961 | 2.958 | 1.941 | 1.52 |
| 2.170840523630551 | 2.962 | 1.944 | 1.522 |
| 2.173982116284141 | 2.966 | 1.946 | 1.524 |
| 2.17712370893773 | 2.971 | 1.949 | 1.526 |
| 2.18026530159132 | 2.975 | 1.952 | 1.528 |
| 2.183406894244909 | 2.979 | 1.955 | 1.53 |
| 2.186548486898499 | 2.983 | 1.957 | 1.533 |
| 2.189690079552089 | 2.988 | 1.96 | 1.535 |
| 2.192831672205678 | 2.992 | 1.963 | 1.537 |
| 2.195973264859268 | 2.996 | 1.966 | 1.539 |
| 2.199114857512857 | 3.001 | 1.969 | 1.541 |
| 2.202256450166447 | 3.005 | 1.971 | 1.543 |
| 2.205398042820036 | 3.009 | 1.974 | 1.545 |
| 2.208539635473626 | 3.013 | 1.977 | 1.547 |
| 2.211681228127216 | 3.017 | 1.98 | 1.549 |
| 2.214822820780805 | 3.022 | 1.982 | 1.551 |
| 2.217964413434395 | 3.026 | 1.985 | 1.553 |
| 2.221106006087984 | 3.03 | 1.988 | 1.555 |
| 2.224247598741574 | 3.034 | 1.991 | 1.557 |
| 2.227389191395164 | 3.039 | 1.994 | 1.559 |
| 2.230530784048753 | 3.043 | 1.996 | 1.562 |
| 2.233672376702343 | 3.047 | 1.999 | 1.564 |
| 2.236813969355933 | 3.051 | 2.002 | 1.566 |
| 2.239955562009522 | 3.055 | 2.005 | 1.568 |
| 2.243097154663112 | 3.059 | 2.008 | 1.57 |
| 2.246238747316701 | 3.064 | 2.01 | 1.572 |
| 2.249380339970291 | 3.068 | 2.013 | 1.574 |
| 2.252521932623881 | 3.072 | 2.016 | 1.576 |
| 2.25566352527747 | 3.076 | 2.019 | 1.578 |
| 2.25880511793106 | 3.08 | 2.022 | 1.581 |
| 2.261946710584649 | 3.084 | 2.024 | 1.583 |
| 2.265088303238239 | 3.088 | 2.027 | 1.585 |
| 2.268229895891829 | 3.092 | 2.03 | 1.587 |
| 2.271371488545418 | 3.097 | 2.033 | 1.589 |
| 2.274513081199008 | 3.101 | 2.036 | 1.591 |
| 2.277654673852597 | 3.105 | 2.038 | 1.593 |
| 2.280796266506186 | 3.109 | 2.041 | 1.595 |
| 2.283937859159776 | 3.113 | 2.044 | 1.598 |
| 2.287079451813366 | 3.117 | 2.047 | 1.6 |
| 2.290221044466955 | 3.121 | 2.05 | 1.602 |
| 2.293362637120545 | 3.125 | 2.053 | 1.604 |
| 2.296504229774135 | 3.129 | 2.055 | 1.606 |
| 2.299645822427724 | 3.133 | 2.058 | 1.608 |
| 2.302787415081314 | 3.137 | 2.061 | 1.611 |
| 2.305929007734904 | 3.141 | 2.064 | 1.613 |
| 2.309070600388493 | 3.145 | 2.067 | 1.615 |
| 2.312212193042083 | 3.149 | 2.07 | 1.617 |
| 2.315353785695672 | 3.153 | 2.072 | 1.619 |
| 2.318495378349262 | 3.157 | 2.075 | 1.622 |
| 2.321636971002852 | 3.161 | 2.078 | 1.624 |
| 2.324778563656441 | 3.165 | 2.081 | 1.626 |
| 2.327920156310031 | 3.169 | 2.084 | 1.628 |
| 2.33106174896362 | 3.173 | 2.087 | 1.63 |
| 2.33420334161721 | 3.177 | 2.089 | 1.633 |
| 2.3373449342708 | 3.181 | 2.092 | 1.635 |
| 2.340486526924389 | 3.185 | 2.095 | 1.637 |
| 2.343628119577979 | 3.189 | 2.098 | 1.639 |
| 2.346769712231568 | 3.193 | 2.101 | 1.642 |
| 2.349911304885158 | 3.197 | 2.104 | 1.644 |
| 2.353052897538748 | 3.201 | 2.106 | 1.646 |
| 2.356194490192337 | 3.205 | 2.109 | 1.648 |
| 2.359336082845927 | 3.209 | 2.112 | 1.65 |
| 2.362477675499516 | 3.213 | 2.115 | 1.653 |
| 2.365619268153106 | 3.217 | 2.118 | 1.655 |
| 2.368760860806696 | 3.221 | 2.121 | 1.657 |
| 2.371902453460285 | 3.224 | 2.124 | 1.659 |
| 2.375044046113875 | 3.228 | 2.127 | 1.662 |
| 2.378185638767464 | 3.232 | 2.129 | 1.664 |
| 2.381327231421054 | 3.236 | 2.132 | 1.666 |
| 2.384468824074644 | 3.24 | 2.135 | 1.669 |
| 2.387610416728233 | 3.244 | 2.138 | 1.671 |
| 2.390752009381823 | 3.248 | 2.141 | 1.673 |
| 2.393893602035412 | 3.252 | 2.144 | 1.675 |
| 2.397035194689002 | 3.255 | 2.147 | 1.678 |
| 2.400176787342591 | 3.259 | 2.149 | 1.68 |
| 2.403318379996181 | 3.263 | 2.152 | 1.682 |
| 2.406459972649771 | 3.267 | 2.155 | 1.685 |
| 2.40960156530336 | 3.271 | 2.158 | 1.687 |
| 2.41274315795695 | 3.275 | 2.161 | 1.689 |
| 2.41588475061054 | 3.278 | 2.164 | 1.692 |
| 2.419026343264129 | 3.282 | 2.167 | 1.694 |
| 2.422167935917719 | 3.286 | 2.17 | 1.696 |
| 2.425309528571308 | 3.29 | 2.173 | 1.699 |
| 2.428451121224898 | 3.294 | 2.175 | 1.701 |
| 2.431592713878488 | 3.297 | 2.178 | 1.703 |
| 2.434734306532077 | 3.301 | 2.181 | 1.706 |
| 2.437875899185667 | 3.305 | 2.184 | 1.708 |
| 2.441017491839256 | 3.309 | 2.187 | 1.71 |
| 2.444159084492846 | 3.313 | 2.19 | 1.713 |
| 2.447300677146435 | 3.316 | 2.193 | 1.715 |
| 2.450442269800025 | 3.32 | 2.196 | 1.717 |
| 2.453583862453615 | 3.324 | 2.199 | 1.72 |
| 2.456725455107204 | 3.328 | 2.202 | 1.722 |
| 2.459867047760794 | 3.331 | 2.204 | 1.725 |
| 2.463008640414384 | 3.335 | 2.207 | 1.727 |
| 2.466150233067973 | 3.339 | 2.21 | 1.729 |
| 2.469291825721563 | 3.342 | 2.213 | 1.732 |
| 2.472433418375152 | 3.346 | 2.216 | 1.734 |
| 2.475575011028742 | 3.35 | 2.219 | 1.737 |
| 2.478716603682332 | 3.354 | 2.222 | 1.739 |
| 2.481858196335921 | 3.357 | 2.225 | 1.741 |
| 2.48499978898951 | 3.361 | 2.228 | 1.744 |
| 2.4881413816431 | 3.365 | 2.231 | 1.746 |
| 2.49128297429669 | 3.368 | 2.234 | 1.749 |
| 2.49442456695028 | 3.372 | 2.237 | 1.751 |
| 2.497566159603869 | 3.376 | 2.24 | 1.753 |
| 2.500707752257458 | 3.379 | 2.242 | 1.756 |
| 2.503849344911048 | 3.383 | 2.245 | 1.758 |
| 2.506990937564638 | 3.387 | 2.248 | 1.761 |
| 2.510132530218228 | 3.39 | 2.251 | 1.763 |
| 2.513274122871817 | 3.394 | 2.254 | 1.766 |
| 2.516415715525407 | 3.398 | 2.257 | 1.768 |
| 2.519557308178996 | 3.401 | 2.26 | 1.771 |
| 2.522698900832586 | 3.405 | 2.263 | 1.773 |
| 2.525840493486176 | 3.409 | 2.266 | 1.776 |
| 2.528982086139765 | 3.412 | 2.269 | 1.778 |
| 2.532123678793355 | 3.416 | 2.272 | 1.781 |
| 2.535265271446944 | 3.419 | 2.275 | 1.783 |
| 2.538406864100534 | 3.423 | 2.278 | 1.786 |
| 2.541548456754124 | 3.427 | 2.281 | 1.788 |
| 2.544690049407713 | 3.43 | 2.284 | 1.791 |
| 2.547831642061302 | 3.434 | 2.287 | 1.793 |
| 2.550973234714892 | 3.437 | 2.29 | 1.796 |
| 2.554114827368482 | 3.441 | 2.293 | 1.798 |
| 2.557256420022072 | 3.445 | 2.296 | 1.801 |
| 2.560398012675661 | 3.448 | 2.298 | 1.803 |
| 2.563539605329251 | 3.452 | 2.301 | 1.806 |
| 2.56668119798284 | 3.455 | 2.304 | 1.808 |
| 2.56982279063643 | 3.459 | 2.307 | 1.811 |
| 2.57296438329002 | 3.462 | 2.31 | 1.813 |
| 2.576105975943609 | 3.466 | 2.313 | 1.816 |
| 2.579247568597199 | 3.469 | 2.316 | 1.818 |
| 2.582389161250788 | 3.473 | 2.319 | 1.821 |
| 2.585530753904377 | 3.477 | 2.322 | 1.824 |
| 2.588672346557967 | 3.48 | 2.325 | 1.826 |
| 2.591813939211557 | 3.484 | 2.328 | 1.829 |
| 2.594955531865147 | 3.487 | 2.331 | 1.831 |
| 2.598097124518736 | 3.491 | 2.334 | 1.834 |
| 2.601238717172326 | 3.494 | 2.337 | 1.836 |
| 2.604380309825915 | 3.498 | 2.34 | 1.839 |
| 2.607521902479505 | 3.501 | 2.343 | 1.842 |
| 2.610663495133095 | 3.505 | 2.346 | 1.844 |
| 2.613805087786684 | 3.508 | 2.349 | 1.847 |
| 2.616946680440274 | 3.512 | 2.352 | 1.849 |
| 2.620088273093863 | 3.515 | 2.355 | 1.852 |
| 2.623229865747452 | 3.519 | 2.358 | 1.855 |
| 2.626371458401042 | 3.522 | 2.361 | 1.857 |
| 2.629513051054632 | 3.526 | 2.364 | 1.86 |
| 2.632654643708222 | 3.529 | 2.367 | 1.863 |
| 2.635796236361811 | 3.533 | 2.37 | 1.865 |
| 2.638937829015401 | 3.536 | 2.373 | 1.868 |
| 2.642079421668991 | 3.54 | 2.376 | 1.871 |
| 2.64522101432258 | 3.543 | 2.379 | 1.873 |
| 2.64836260697617 | 3.546 | 2.382 | 1.876 |
| 2.651504199629759 | 3.55 | 2.385 | 1.879 |
| 2.654645792283349 | 3.553 | 2.388 | 1.881 |
| 2.657787384936938 | 3.557 | 2.391 | 1.884 |
| 2.660928977590528 | 3.56 | 2.394 | 1.887 |
| 2.664070570244118 | 3.564 | 2.397 | 1.889 |
| 2.667212162897707 | 3.567 | 2.4 | 1.892 |
| 2.670353755551297 | 3.57 | 2.403 | 1.895 |
| 2.673495348204887 | 3.574 | 2.406 | 1.897 |
| 2.676636940858476 | 3.577 | 2.409 | 1.9 |
| 2.679778533512066 | 3.581 | 2.412 | 1.903 |
| 2.682920126165655 | 3.584 | 2.415 | 1.905 |
| 2.686061718819245 | 3.588 | 2.418 | 1.908 |
| 2.689203311472835 | 3.591 | 2.421 | 1.911 |
| 2.692344904126424 | 3.594 | 2.424 | 1.914 |
| 2.695486496780014 | 3.598 | 2.427 | 1.916 |
| 2.698628089433603 | 3.601 | 2.43 | 1.919 |
| 2.701769682087193 | 3.605 | 2.433 | 1.922 |
| 2.704911274740782 | 3.608 | 2.436 | 1.925 |
| 2.708052867394372 | 3.611 | 2.439 | 1.927 |
| 2.711194460047962 | 3.615 | 2.442 | 1.93 |
| 2.714336052701551 | 3.618 | 2.446 | 1.933 |
| 2.717477645355141 | 3.621 | 2.449 | 1.936 |
| 2.720619238008731 | 3.625 | 2.452 | 1.938 |
| 2.72376083066232 | 3.628 | 2.455 | 1.941 |
| 2.72690242331591 | 3.632 | 2.458 | 1.944 |
| 2.730044015969499 | 3.635 | 2.461 | 1.947 |
| 2.733185608623089 | 3.638 | 2.464 | 1.95 |
| 2.736327201276678 | 3.642 | 2.467 | 1.952 |
| 2.739468793930268 | 3.645 | 2.47 | 1.955 |
| 2.742610386583858 | 3.648 | 2.473 | 1.958 |
| 2.745751979237447 | 3.652 | 2.476 | 1.961 |
| 2.748893571891036 | 3.655 | 2.479 | 1.964 |
| 2.752035164544627 | 3.658 | 2.482 | 1.966 |
| 2.755176757198216 | 3.662 | 2.485 | 1.969 |
| 2.758318349851806 | 3.665 | 2.488 | 1.972 |
| 2.761459942505395 | 3.668 | 2.491 | 1.975 |
| 2.764601535158985 | 3.672 | 2.494 | 1.978 |
| 2.767743127812574 | 3.675 | 2.497 | 1.98 |
| 2.770884720466164 | 3.678 | 2.5 | 1.983 |
| 2.774026313119754 | 3.682 | 2.503 | 1.986 |
| 2.777167905773343 | 3.685 | 2.507 | 1.989 |
| 2.780309498426932 | 3.688 | 2.51 | 1.992 |
| 2.783451091080522 | 3.691 | 2.513 | 1.995 |
| 2.786592683734112 | 3.695 | 2.516 | 1.998 |
| 2.789734276387701 | 3.698 | 2.519 | 2 |
| 2.792875869041291 | 3.701 | 2.522 | 2.003 |
| 2.796017461694881 | 3.705 | 2.525 | 2.006 |
| 2.79915905434847 | 3.708 | 2.528 | 2.009 |
| 2.80230064700206 | 3.711 | 2.531 | 2.012 |
| 2.80544223965565 | 3.715 | 2.534 | 2.015 |
| 2.808583832309239 | 3.718 | 2.537 | 2.018 |
| 2.811725424962829 | 3.721 | 2.54 | 2.021 |
| 2.814867017616419 | 3.724 | 2.543 | 2.024 |
| 2.818008610270008 | 3.728 | 2.546 | 2.026 |
| 2.821150202923598 | 3.731 | 2.55 | 2.029 |
| 2.824291795577187 | 3.734 | 2.553 | 2.032 |
| 2.827433388230777 | 3.737 | 2.556 | 2.035 |
| 2.830574980884366 | 3.741 | 2.559 | 2.038 |
| 2.833716573537956 | 3.744 | 2.562 | 2.041 |
| 2.836858166191546 | 3.747 | 2.565 | 2.044 |
| 2.839999758845135 | 3.751 | 2.568 | 2.047 |
| 2.843141351498725 | 3.754 | 2.571 | 2.05 |
| 2.846282944152314 | 3.757 | 2.574 | 2.053 |
| 2.849424536805904 | 3.76 | 2.577 | 2.056 |
| 2.852566129459494 | 3.764 | 2.58 | 2.059 |
| 2.855707722113083 | 3.767 | 2.584 | 2.062 |
| 2.858849314766673 | 3.77 | 2.587 | 2.065 |
| 2.861990907420262 | 3.773 | 2.59 | 2.068 |
| 2.865132500073852 | 3.776 | 2.593 | 2.071 |
| 2.868274092727442 | 3.78 | 2.596 | 2.073 |
| 2.871415685381031 | 3.783 | 2.599 | 2.076 |
| 2.874557278034621 | 3.786 | 2.602 | 2.079 |
| 2.87769887068821 | 3.789 | 2.605 | 2.082 |
| 2.8808404633418 | 3.793 | 2.608 | 2.085 |
| 2.88398205599539 | 3.796 | 2.611 | 2.088 |
| 2.88712364864898 | 3.799 | 2.614 | 2.091 |
| 2.890265241302569 | 3.802 | 2.618 | 2.094 |
| 2.893406833956158 | 3.806 | 2.621 | 2.097 |
| 2.896548426609748 | 3.809 | 2.624 | 2.1 |
| 2.899690019263338 | 3.812 | 2.627 | 2.103 |
| 2.902831611916927 | 3.815 | 2.63 | 2.106 |
| 2.905973204570517 | 3.818 | 2.633 | 2.109 |
| 2.909114797224106 | 3.822 | 2.636 | 2.112 |
| 2.912256389877696 | 3.825 | 2.639 | 2.115 |
| 2.915397982531286 | 3.828 | 2.642 | 2.118 |
| 2.918539575184875 | 3.831 | 2.646 | 2.121 |
| 2.921681167838465 | 3.834 | 2.649 | 2.124 |
| 2.924822760492054 | 3.838 | 2.652 | 2.127 |
| 2.927964353145644 | 3.841 | 2.655 | 2.13 |
| 2.931105945799234 | 3.844 | 2.658 | 2.134 |
| 2.934247538452823 | 3.847 | 2.661 | 2.137 |
| 2.937389131106413 | 3.85 | 2.664 | 2.14 |
| 2.940530723760002 | 3.854 | 2.667 | 2.143 |
| 2.943672316413592 | 3.857 | 2.67 | 2.146 |
| 2.946813909067182 | 3.86 | 2.674 | 2.149 |
| 2.949955501720771 | 3.863 | 2.677 | 2.152 |
| 2.953097094374361 | 3.866 | 2.68 | 2.155 |
| 2.95623868702795 | 3.87 | 2.683 | 2.158 |
| 2.95938027968154 | 3.873 | 2.686 | 2.161 |
| 2.96252187233513 | 3.876 | 2.689 | 2.164 |
| 2.965663464988719 | 3.879 | 2.692 | 2.167 |
| 2.968805057642309 | 3.882 | 2.695 | 2.17 |
| 2.971946650295898 | 3.885 | 2.699 | 2.173 |
| 2.975088242949488 | 3.889 | 2.702 | 2.176 |
| 2.978229835603078 | 3.892 | 2.705 | 2.179 |
| 2.981371428256667 | 3.895 | 2.708 | 2.182 |
| 2.984513020910257 | 3.898 | 2.711 | 2.186 |
| 2.987654613563846 | 3.901 | 2.714 | 2.189 |
| 2.990796206217436 | 3.905 | 2.717 | 2.192 |
| 2.993937798871025 | 3.908 | 2.72 | 2.195 |
| 2.997079391524615 | 3.911 | 2.724 | 2.198 |
| 3.000220984178205 | 3.914 | 2.727 | 2.201 |
| 3.003362576831794 | 3.917 | 2.73 | 2.204 |
| 3.006504169485384 | 3.92 | 2.733 | 2.207 |
| 3.009645762138974 | 3.924 | 2.736 | 2.21 |
| 3.012787354792563 | 3.927 | 2.739 | 2.213 |
| 3.015928947446153 | 3.93 | 2.742 | 2.216 |
| 3.019070540099742 | 3.933 | 2.745 | 2.22 |
| 3.022212132753332 | 3.936 | 2.749 | 2.223 |
| 3.025353725406922 | 3.939 | 2.752 | 2.226 |
| 3.028495318060511 | 3.942 | 2.755 | 2.229 |
| 3.031636910714101 | 3.946 | 2.758 | 2.232 |
| 3.03477850336769 | 3.949 | 2.761 | 2.235 |
| 3.03792009602128 | 3.952 | 2.764 | 2.238 |
| 3.04106168867487 | 3.955 | 2.767 | 2.241 |
| 3.04420328132846 | 3.958 | 2.771 | 2.244 |
| 3.047344873982049 | 3.961 | 2.774 | 2.248 |
| 3.050486466635638 | 3.965 | 2.777 | 2.251 |
| 3.053628059289228 | 3.968 | 2.78 | 2.254 |
| 3.056769651942818 | 3.971 | 2.783 | 2.257 |
| 3.059911244596407 | 3.974 | 2.786 | 2.26 |
| 3.063052837249997 | 3.977 | 2.789 | 2.263 |
| 3.066194429903586 | 3.98 | 2.792 | 2.266 |
| 3.069336022557176 | 3.983 | 2.796 | 2.269 |
| 3.072477615210766 | 3.987 | 2.799 | 2.273 |
| 3.075619207864355 | 3.99 | 2.802 | 2.276 |
| 3.078760800517945 | 3.993 | 2.805 | 2.279 |
| 3.081902393171534 | 3.996 | 2.808 | 2.282 |
| 3.085043985825124 | 3.999 | 2.811 | 2.285 |
| 3.088185578478713 | 4.002 | 2.814 | 2.288 |
| 3.091327171132303 | 4.005 | 2.818 | 2.291 |
| 3.094468763785893 | 4.009 | 2.821 | 2.295 |
| 3.097610356439482 | 4.012 | 2.824 | 2.298 |
| 3.100751949093072 | 4.015 | 2.827 | 2.301 |
| 3.103893541746661 | 4.018 | 2.83 | 2.304 |
| 3.107035134400251 | 4.021 | 2.833 | 2.307 |
| 3.110176727053841 | 4.024 | 2.836 | 2.31 |
| 3.11331831970743 | 4.028 | 2.84 | 2.313 |
| 3.11645991236102 | 4.031 | 2.843 | 2.316 |
| 3.11960150501461 | 4.034 | 2.846 | 2.32 |
| 3.122743097668199 | 4.037 | 2.849 | 2.323 |
| 3.125884690321789 | 4.04 | 2.852 | 2.326 |
| 3.129026282975378 | 4.043 | 2.855 | 2.329 |
| 3.132167875628968 | 4.046 | 2.858 | 2.332 |
| 3.135309468282557 | 4.049 | 2.862 | 2.335 |
| 3.138451060936147 | 4.053 | 2.865 | 2.338 |
| 3.141592653589737 | 4.056 | 2.868 | 2.342 |
| 3.144734246243326 | 4.059 | 2.871 | 2.345 |
| 3.147875838896916 | 4.062 | 2.874 | 2.348 |
| 3.151017431550505 | 4.065 | 2.877 | 2.351 |
| 3.154159024204095 | 4.068 | 2.88 | 2.354 |
| 3.157300616857685 | 4.071 | 2.884 | 2.357 |
| 3.160442209511274 | 4.075 | 2.887 | 2.36 |
| 3.163583802164864 | 4.078 | 2.89 | 2.364 |
| 3.166725394818453 | 4.081 | 2.893 | 2.367 |
| 3.169866987472043 | 4.084 | 2.896 | 2.37 |
| 3.173008580125633 | 4.087 | 2.899 | 2.373 |
| 3.176150172779222 | 4.09 | 2.902 | 2.376 |
| 3.179291765432812 | 4.093 | 2.906 | 2.379 |
| 3.182433358086401 | 4.097 | 2.909 | 2.382 |
| 3.185574950739991 | 4.1 | 2.912 | 2.386 |
| 3.188716543393581 | 4.103 | 2.915 | 2.389 |
| 3.19185813604717 | 4.106 | 2.918 | 2.392 |
| 3.19499972870076 | 4.109 | 2.921 | 2.395 |
| 3.198141321354349 | 4.112 | 2.924 | 2.398 |
| 3.20128291400794 | 4.115 | 2.928 | 2.401 |
| 3.204424506661528 | 4.119 | 2.931 | 2.404 |
| 3.207566099315118 | 4.122 | 2.934 | 2.408 |
| 3.210707691968708 | 4.125 | 2.937 | 2.411 |
| 3.213849284622297 | 4.128 | 2.94 | 2.414 |
| 3.216990877275887 | 4.131 | 2.943 | 2.417 |
| 3.220132469929476 | 4.134 | 2.946 | 2.42 |
| 3.223274062583066 | 4.138 | 2.95 | 2.423 |
| 3.226415655236656 | 4.141 | 2.953 | 2.426 |
| 3.229557247890245 | 4.144 | 2.956 | 2.429 |
| 3.232698840543835 | 4.147 | 2.959 | 2.433 |
| 3.235840433197425 | 4.15 | 2.962 | 2.436 |
| 3.238982025851014 | 4.153 | 2.965 | 2.439 |
| 3.242123618504604 | 4.156 | 2.968 | 2.442 |
| 3.245265211158193 | 4.16 | 2.971 | 2.445 |
| 3.248406803811783 | 4.163 | 2.975 | 2.448 |
| 3.251548396465373 | 4.166 | 2.978 | 2.451 |
| 3.254689989118962 | 4.169 | 2.981 | 2.454 |
| 3.257831581772551 | 4.172 | 2.984 | 2.457 |
| 3.260973174426141 | 4.175 | 2.987 | 2.461 |
| 3.26411476707973 | 4.179 | 2.99 | 2.464 |
| 3.267256359733321 | 4.182 | 2.993 | 2.467 |
| 3.27039795238691 | 4.185 | 2.997 | 2.47 |
| 3.2735395450405 | 4.188 | 3 | 2.473 |
| 3.276681137694089 | 4.191 | 3.003 | 2.476 |
| 3.279822730347679 | 4.194 | 3.006 | 2.479 |
| 3.282964323001269 | 4.198 | 3.009 | 2.482 |
| 3.286105915654858 | 4.201 | 3.012 | 2.485 |
| 3.289247508308448 | 4.204 | 3.015 | 2.488 |
| 3.292389100962037 | 4.207 | 3.018 | 2.492 |
| 3.295530693615627 | 4.21 | 3.022 | 2.495 |
| 3.298672286269217 | 4.213 | 3.025 | 2.498 |
| 3.301813878922806 | 4.217 | 3.028 | 2.501 |
| 3.304955471576396 | 4.22 | 3.031 | 2.504 |
| 3.308097064229985 | 4.223 | 3.034 | 2.507 |
| 3.311238656883575 | 4.226 | 3.037 | 2.51 |
| 3.314380249537165 | 4.229 | 3.04 | 2.513 |
| 3.317521842190754 | 4.232 | 3.043 | 2.516 |
| 3.320663434844344 | 4.236 | 3.047 | 2.519 |
| 3.323805027497933 | 4.239 | 3.05 | 2.522 |
| 3.326946620151523 | 4.242 | 3.053 | 2.525 |
| 3.330088212805113 | 4.245 | 3.056 | 2.528 |
| 3.333229805458702 | 4.248 | 3.059 | 2.531 |
| 3.336371398112292 | 4.252 | 3.062 | 2.534 |
| 3.339512990765881 | 4.255 | 3.065 | 2.538 |
| 3.342654583419471 | 4.258 | 3.068 | 2.541 |
| 3.345796176073061 | 4.261 | 3.072 | 2.544 |
| 3.34893776872665 | 4.264 | 3.075 | 2.547 |
| 3.35207936138024 | 4.268 | 3.078 | 2.55 |
| 3.355220954033829 | 4.271 | 3.081 | 2.553 |
| 3.358362546687419 | 4.274 | 3.084 | 2.556 |
| 3.361504139341009 | 4.277 | 3.087 | 2.559 |
| 3.364645731994598 | 4.28 | 3.09 | 2.562 |
| 3.367787324648188 | 4.284 | 3.093 | 2.565 |
| 3.370928917301777 | 4.287 | 3.096 | 2.568 |
| 3.374070509955367 | 4.29 | 3.1 | 2.571 |
| 3.377212102608956 | 4.293 | 3.103 | 2.574 |
| 3.380353695262546 | 4.296 | 3.106 | 2.577 |
| 3.383495287916136 | 4.3 | 3.109 | 2.58 |
| 3.386636880569725 | 4.303 | 3.112 | 2.583 |
| 3.389778473223315 | 4.306 | 3.115 | 2.586 |
| 3.392920065876904 | 4.309 | 3.118 | 2.589 |
| 3.396061658530494 | 4.312 | 3.121 | 2.592 |
| 3.399203251184084 | 4.316 | 3.124 | 2.595 |
| 3.402344843837673 | 4.319 | 3.127 | 2.598 |
| 3.405486436491263 | 4.322 | 3.131 | 2.601 |
| 3.408628029144852 | 4.325 | 3.134 | 2.604 |
| 3.411769621798442 | 4.329 | 3.137 | 2.607 |
| 3.414911214452032 | 4.332 | 3.14 | 2.61 |
| 3.418052807105621 | 4.335 | 3.143 | 2.613 |
| 3.421194399759211 | 4.338 | 3.146 | 2.616 |
| 3.4243359924128 | 4.342 | 3.149 | 2.619 |
| 3.42747758506639 | 4.345 | 3.152 | 2.622 |
| 3.43061917771998 | 4.348 | 3.155 | 2.625 |
| 3.433760770373569 | 4.351 | 3.158 | 2.627 |
| 3.436902363027159 | 4.355 | 3.162 | 2.63 |
| 3.440043955680748 | 4.358 | 3.165 | 2.633 |
| 3.443185548334338 | 4.361 | 3.168 | 2.636 |
| 3.446327140987927 | 4.364 | 3.171 | 2.639 |
| 3.449468733641517 | 4.368 | 3.174 | 2.642 |
| 3.452610326295107 | 4.371 | 3.177 | 2.645 |
| 3.455751918948696 | 4.374 | 3.18 | 2.648 |
| 3.458893511602286 | 4.377 | 3.183 | 2.651 |
| 3.462035104255876 | 4.381 | 3.186 | 2.654 |
| 3.465176696909465 | 4.384 | 3.189 | 2.657 |
| 3.468318289563055 | 4.387 | 3.192 | 2.66 |
| 3.471459882216644 | 4.39 | 3.195 | 2.663 |
| 3.474601474870234 | 4.394 | 3.199 | 2.665 |
| 3.477743067523824 | 4.397 | 3.202 | 2.668 |
| 3.480884660177413 | 4.4 | 3.205 | 2.671 |
| 3.484026252831002 | 4.404 | 3.208 | 2.674 |
| 3.487167845484592 | 4.407 | 3.211 | 2.677 |
| 3.490309438138182 | 4.41 | 3.214 | 2.68 |
| 3.493451030791772 | 4.413 | 3.217 | 2.683 |
| 3.496592623445361 | 4.417 | 3.22 | 2.686 |
| 3.499734216098951 | 4.42 | 3.223 | 2.688 |
| 3.50287580875254 | 4.423 | 3.226 | 2.691 |
| 3.50601740140613 | 4.427 | 3.229 | 2.694 |
| 3.50915899405972 | 4.43 | 3.232 | 2.697 |
| 3.512300586713309 | 4.433 | 3.235 | 2.7 |
| 3.515442179366899 | 4.437 | 3.238 | 2.703 |
| 3.518583772020488 | 4.44 | 3.241 | 2.706 |
| 3.521725364674078 | 4.443 | 3.245 | 2.708 |
| 3.524866957327668 | 4.447 | 3.248 | 2.711 |
| 3.528008549981257 | 4.45 | 3.251 | 2.714 |
| 3.531150142634847 | 4.453 | 3.254 | 2.717 |
| 3.534291735288436 | 4.457 | 3.257 | 2.72 |
| 3.537433327942026 | 4.46 | 3.26 | 2.722 |
| 3.540574920595616 | 4.463 | 3.263 | 2.725 |
| 3.543716513249205 | 4.467 | 3.266 | 2.728 |
| 3.546858105902795 | 4.47 | 3.269 | 2.731 |
| 3.549999698556384 | 4.473 | 3.272 | 2.734 |
| 3.553141291209974 | 4.477 | 3.275 | 2.736 |
| 3.556282883863564 | 4.48 | 3.278 | 2.739 |
| 3.559424476517153 | 4.483 | 3.281 | 2.742 |
| 3.562566069170743 | 4.487 | 3.284 | 2.745 |
| 3.565707661824332 | 4.49 | 3.287 | 2.748 |
| 3.568849254477922 | 4.494 | 3.29 | 2.75 |
| 3.571990847131511 | 4.497 | 3.293 | 2.753 |
| 3.575132439785101 | 4.5 | 3.296 | 2.756 |
| 3.578274032438691 | 4.504 | 3.299 | 2.759 |
| 3.58141562509228 | 4.507 | 3.302 | 2.761 |
| 3.58455721774587 | 4.51 | 3.305 | 2.764 |
| 3.58769881039946 | 4.514 | 3.308 | 2.767 |
| 3.590840403053049 | 4.517 | 3.311 | 2.77 |
| 3.593981995706639 | 4.521 | 3.314 | 2.772 |
| 3.597123588360228 | 4.524 | 3.317 | 2.775 |
| 3.600265181013818 | 4.527 | 3.321 | 2.778 |
| 3.603406773667407 | 4.531 | 3.324 | 2.78 |
| 3.606548366320997 | 4.534 | 3.327 | 2.783 |
| 3.609689958974587 | 4.538 | 3.33 | 2.786 |
| 3.612831551628176 | 4.541 | 3.333 | 2.789 |
| 3.615973144281766 | 4.545 | 3.336 | 2.791 |
| 3.619114736935355 | 4.548 | 3.339 | 2.794 |
| 3.622256329588945 | 4.551 | 3.342 | 2.797 |
| 3.625397922242534 | 4.555 | 3.345 | 2.799 |
| 3.628539514896124 | 4.558 | 3.348 | 2.802 |
| 3.631681107549714 | 4.562 | 3.351 | 2.805 |
| 3.634822700203303 | 4.565 | 3.354 | 2.807 |
| 3.637964292856893 | 4.569 | 3.357 | 2.81 |
| 3.641105885510483 | 4.572 | 3.36 | 2.813 |
| 3.644247478164072 | 4.576 | 3.363 | 2.815 |
| 3.647389070817662 | 4.579 | 3.366 | 2.818 |
| 3.650530663471251 | 4.582 | 3.369 | 2.821 |
| 3.653672256124841 | 4.586 | 3.372 | 2.823 |
| 3.656813848778431 | 4.589 | 3.375 | 2.826 |
| 3.65995544143202 | 4.593 | 3.378 | 2.828 |
| 3.66309703408561 | 4.596 | 3.381 | 2.831 |
| 3.666238626739199 | 4.6 | 3.384 | 2.834 |
| 3.66938021939279 | 4.603 | 3.387 | 2.836 |
| 3.672521812046378 | 4.607 | 3.39 | 2.839 |
| 3.675663404699968 | 4.61 | 3.393 | 2.842 |
| 3.678804997353558 | 4.614 | 3.396 | 2.844 |
| 3.681946590007147 | 4.617 | 3.399 | 2.847 |
| 3.685088182660737 | 4.621 | 3.402 | 2.849 |
| 3.688229775314326 | 4.624 | 3.405 | 2.852 |
| 3.691371367967916 | 4.628 | 3.408 | 2.854 |
| 3.694512960621506 | 4.631 | 3.411 | 2.857 |
| 3.697654553275095 | 4.635 | 3.414 | 2.86 |
| 3.700796145928685 | 4.639 | 3.416 | 2.862 |
| 3.703937738582274 | 4.642 | 3.419 | 2.865 |
| 3.707079331235864 | 4.646 | 3.422 | 2.867 |
| 3.710220923889454 | 4.649 | 3.425 | 2.87 |
| 3.713362516543043 | 4.653 | 3.428 | 2.872 |
| 3.716504109196633 | 4.656 | 3.431 | 2.875 |
| 3.719645701850223 | 4.66 | 3.434 | 2.878 |
| 3.722787294503812 | 4.663 | 3.437 | 2.88 |
| 3.725928887157402 | 4.667 | 3.44 | 2.883 |
| 3.729070479810991 | 4.671 | 3.443 | 2.885 |
| 3.732212072464581 | 4.674 | 3.446 | 2.888 |
| 3.735353665118171 | 4.678 | 3.449 | 2.89 |
| 3.73849525777176 | 4.681 | 3.452 | 2.893 |
| 3.74163685042535 | 4.685 | 3.455 | 2.895 |
| 3.744778443078939 | 4.689 | 3.458 | 2.898 |
| 3.747920035732529 | 4.692 | 3.461 | 2.9 |
| 3.751061628386119 | 4.696 | 3.464 | 2.903 |
| 3.754203221039708 | 4.699 | 3.467 | 2.905 |
| 3.757344813693298 | 4.703 | 3.47 | 2.908 |
| 3.760486406346887 | 4.707 | 3.473 | 2.91 |
| 3.763627999000477 | 4.71 | 3.476 | 2.913 |
| 3.766769591654067 | 4.714 | 3.479 | 2.915 |
| 3.769911184307656 | 4.718 | 3.482 | 2.917 |
| 3.773052776961246 | 4.721 | 3.484 | 2.92 |
| 3.776194369614835 | 4.725 | 3.487 | 2.922 |
| 3.779335962268425 | 4.729 | 3.49 | 2.925 |
| 3.782477554922014 | 4.732 | 3.493 | 2.927 |
| 3.785619147575604 | 4.736 | 3.496 | 2.93 |
| 3.788760740229193 | 4.74 | 3.499 | 2.932 |
| 3.791902332882783 | 4.743 | 3.502 | 2.935 |
| 3.795043925536373 | 4.747 | 3.505 | 2.937 |
| 3.798185518189962 | 4.751 | 3.508 | 2.939 |
| 3.801327110843552 | 4.754 | 3.511 | 2.942 |
| 3.804468703497142 | 4.758 | 3.514 | 2.944 |
| 3.807610296150731 | 4.762 | 3.517 | 2.947 |
| 3.810751888804321 | 4.765 | 3.52 | 2.949 |
| 3.813893481457911 | 4.769 | 3.523 | 2.951 |
| 3.8170350741115 | 4.773 | 3.525 | 2.954 |
| 3.82017666676509 | 4.777 | 3.528 | 2.956 |
| 3.823318259418679 | 4.78 | 3.531 | 2.959 |
| 3.826459852072269 | 4.784 | 3.534 | 2.961 |
| 3.829601444725859 | 4.788 | 3.537 | 2.963 |
| 3.832743037379448 | 4.791 | 3.54 | 2.966 |
| 3.835884630033038 | 4.795 | 3.543 | 2.968 |
| 3.839026222686627 | 4.799 | 3.546 | 2.971 |
| 3.842167815340217 | 4.803 | 3.549 | 2.973 |
| 3.845309407993807 | 4.807 | 3.552 | 2.975 |
| 3.848451000647396 | 4.81 | 3.554 | 2.978 |
| 3.851592593300986 | 4.814 | 3.557 | 2.98 |
| 3.854734185954575 | 4.818 | 3.56 | 2.982 |
| 3.857875778608165 | 4.822 | 3.563 | 2.985 |
| 3.861017371261755 | 4.825 | 3.566 | 2.987 |
| 3.864158963915344 | 4.829 | 3.569 | 2.989 |
| 3.867300556568933 | 4.833 | 3.572 | 2.992 |
| 3.870442149222523 | 4.837 | 3.575 | 2.994 |
| 3.873583741876112 | 4.841 | 3.578 | 2.996 |
| 3.876725334529703 | 4.845 | 3.58 | 2.999 |
| 3.879866927183292 | 4.848 | 3.583 | 3.001 |
| 3.883008519836882 | 4.852 | 3.586 | 3.003 |
| 3.886150112490471 | 4.856 | 3.589 | 3.005 |
| 3.889291705144061 | 4.86 | 3.592 | 3.008 |
| 3.892433297797651 | 4.864 | 3.595 | 3.01 |
| 3.89557489045124 | 4.868 | 3.598 | 3.012 |
| 3.89871648310483 | 4.872 | 3.601 | 3.015 |
| 3.901858075758419 | 4.875 | 3.603 | 3.017 |
| 3.904999668412009 | 4.879 | 3.606 | 3.019 |
| 3.908141261065598 | 4.883 | 3.609 | 3.021 |
| 3.911282853719188 | 4.887 | 3.612 | 3.024 |
| 3.914424446372778 | 4.891 | 3.615 | 3.026 |
| 3.917566039026367 | 4.895 | 3.618 | 3.028 |
| 3.920707631679957 | 4.899 | 3.621 | 3.03 |
| 3.923849224333547 | 4.903 | 3.624 | 3.033 |
| 3.926990816987136 | 4.907 | 3.626 | 3.035 |
| 3.930132409640726 | 4.911 | 3.629 | 3.037 |
| 3.933274002294315 | 4.914 | 3.632 | 3.039 |
| 3.936415594947905 | 4.918 | 3.635 | 3.042 |
| 3.939557187601495 | 4.922 | 3.638 | 3.044 |
| 3.942698780255084 | 4.926 | 3.641 | 3.046 |
| 3.945840372908674 | 4.93 | 3.643 | 3.048 |
| 3.948981965562263 | 4.934 | 3.646 | 3.051 |
| 3.952123558215853 | 4.938 | 3.649 | 3.053 |
| 3.955265150869442 | 4.942 | 3.652 | 3.055 |
| 3.958406743523032 | 4.946 | 3.655 | 3.057 |
| 3.961548336176622 | 4.95 | 3.658 | 3.059 |
| 3.964689928830211 | 4.954 | 3.661 | 3.062 |
| 3.967831521483801 | 4.958 | 3.663 | 3.064 |
| 3.97097311413739 | 4.962 | 3.666 | 3.066 |
| 3.97411470679098 | 4.966 | 3.669 | 3.068 |
| 3.97725629944457 | 4.97 | 3.672 | 3.07 |
| 3.98039789209816 | 4.974 | 3.675 | 3.073 |
| 3.983539484751749 | 4.978 | 3.678 | 3.075 |
| 3.986681077405338 | 4.982 | 3.68 | 3.077 |
| 3.989822670058928 | 4.986 | 3.683 | 3.079 |
| 3.992964262712517 | 4.99 | 3.686 | 3.081 |
| 3.996105855366107 | 4.995 | 3.689 | 3.083 |
| 3.999247448019697 | 4.999 | 3.692 | 3.086 |
| 4.002389040673287 | 5.003 | 3.694 | 3.088 |
| 4.005530633326877 | 5.007 | 3.697 | 3.09 |
| 4.008672225980466 | 5.011 | 3.7 | 3.092 |
| 4.011813818634056 | 5.015 | 3.703 | 3.094 |
| 4.014955411287645 | 5.019 | 3.706 | 3.096 |
| 4.018097003941234 | 5.023 | 3.709 | 3.098 |
| 4.021238596594824 | 5.027 | 3.711 | 3.101 |
| 4.024380189248414 | 5.031 | 3.714 | 3.103 |
| 4.027521781902004 | 5.036 | 3.717 | 3.105 |
| 4.030663374555593 | 5.04 | 3.72 | 3.107 |
| 4.033804967209183 | 5.044 | 3.723 | 3.109 |
| 4.036946559862773 | 5.048 | 3.725 | 3.111 |
| 4.040088152516362 | 5.052 | 3.728 | 3.113 |
| 4.043229745169951 | 5.056 | 3.731 | 3.115 |
| 4.046371337823541 | 5.06 | 3.734 | 3.117 |
| 4.049512930477131 | 5.065 | 3.737 | 3.12 |
| 4.05265452313072 | 5.069 | 3.739 | 3.122 |
| 4.05579611578431 | 5.073 | 3.742 | 3.124 |
| 4.0589377084379 | 5.077 | 3.745 | 3.126 |
| 4.062079301091489 | 5.081 | 3.748 | 3.128 |
| 4.065220893745079 | 5.086 | 3.751 | 3.13 |
| 4.068362486398668 | 5.09 | 3.753 | 3.132 |
| 4.071504079052258 | 5.094 | 3.756 | 3.134 |
| 4.074645671705848 | 5.098 | 3.759 | 3.136 |
| 4.077787264359437 | 5.103 | 3.762 | 3.138 |
| 4.080928857013027 | 5.107 | 3.764 | 3.14 |
| 4.084070449666616 | 5.111 | 3.767 | 3.142 |
| 4.087212042320206 | 5.115 | 3.77 | 3.145 |
| 4.090353634973795 | 5.12 | 3.773 | 3.147 |
| 4.093495227627385 | 5.124 | 3.776 | 3.149 |
| 4.096636820280975 | 5.128 | 3.778 | 3.151 |
| 4.099778412934564 | 5.132 | 3.781 | 3.153 |
| 4.102920005588154 | 5.137 | 3.784 | 3.155 |
| 4.106061598241744 | 5.141 | 3.787 | 3.157 |
| 4.109203190895333 | 5.145 | 3.789 | 3.159 |
| 4.112344783548923 | 5.15 | 3.792 | 3.161 |
| 4.115486376202512 | 5.154 | 3.795 | 3.163 |
| 4.118627968856102 | 5.158 | 3.798 | 3.165 |
| 4.121769561509692 | 5.163 | 3.8 | 3.167 |
| 4.124911154163281 | 5.167 | 3.803 | 3.169 |
| 4.128052746816871 | 5.171 | 3.806 | 3.171 |
| 4.13119433947046 | 5.176 | 3.809 | 3.173 |
| 4.13433593212405 | 5.18 | 3.811 | 3.175 |
| 4.13747752477764 | 5.184 | 3.814 | 3.177 |
| 4.14061911743123 | 5.189 | 3.817 | 3.179 |
| 4.143760710084818 | 5.193 | 3.82 | 3.181 |
| 4.146902302738408 | 5.198 | 3.822 | 3.183 |
| 4.150043895391998 | 5.202 | 3.825 | 3.185 |
| 4.153185488045588 | 5.206 | 3.828 | 3.187 |
| 4.156327080699177 | 5.211 | 3.831 | 3.189 |
| 4.159468673352766 | 5.215 | 3.833 | 3.191 |
| 4.162610266006356 | 5.22 | 3.836 | 3.193 |
| 4.165751858659946 | 5.224 | 3.839 | 3.195 |
| 4.168893451313535 | 5.228 | 3.842 | 3.197 |
| 4.172035043967125 | 5.233 | 3.844 | 3.199 |
| 4.175176636620715 | 5.237 | 3.847 | 3.201 |
| 4.178318229274304 | 5.242 | 3.85 | 3.203 |
| 4.181459821927894 | 5.246 | 3.853 | 3.205 |
| 4.184601414581484 | 5.251 | 3.855 | 3.207 |
| 4.187743007235073 | 5.255 | 3.858 | 3.209 |
| 4.190884599888663 | 5.26 | 3.861 | 3.211 |
| 4.194026192542252 | 5.264 | 3.864 | 3.213 |
| 4.197167785195842 | 5.269 | 3.866 | 3.215 |
| 4.200309377849432 | 5.273 | 3.869 | 3.217 |
| 4.203450970503021 | 5.278 | 3.872 | 3.219 |
| 4.206592563156611 | 5.282 | 3.874 | 3.221 |
| 4.2097341558102 | 5.287 | 3.877 | 3.223 |
| 4.21287574846379 | 5.291 | 3.88 | 3.224 |
| 4.21601734111738 | 5.296 | 3.883 | 3.226 |
| 4.21915893377097 | 5.3 | 3.885 | 3.228 |
| 4.222300526424559 | 5.305 | 3.888 | 3.23 |
| 4.225442119078148 | 5.31 | 3.891 | 3.232 |
| 4.228583711731738 | 5.314 | 3.894 | 3.234 |
| 4.231725304385327 | 5.319 | 3.896 | 3.236 |
| 4.234866897038917 | 5.323 | 3.899 | 3.238 |
| 4.238008489692506 | 5.328 | 3.902 | 3.24 |
| 4.241150082346096 | 5.333 | 3.904 | 3.242 |
| 4.244291674999685 | 5.337 | 3.907 | 3.244 |
| 4.247433267653276 | 5.342 | 3.91 | 3.246 |
| 4.250574860306865 | 5.346 | 3.912 | 3.248 |
| 4.253716452960455 | 5.351 | 3.915 | 3.25 |
| 4.256858045614044 | 5.356 | 3.918 | 3.251 |
| 4.259999638267634 | 5.36 | 3.921 | 3.253 |
| 4.263141230921224 | 5.365 | 3.923 | 3.255 |
| 4.266282823574813 | 5.37 | 3.926 | 3.257 |
| 4.269424416228403 | 5.374 | 3.929 | 3.259 |
| 4.272566008881992 | 5.379 | 3.931 | 3.261 |
| 4.275707601535582 | 5.384 | 3.934 | 3.263 |
| 4.27884919418917 | 5.388 | 3.937 | 3.265 |
| 4.28199078684276 | 5.393 | 3.94 | 3.267 |
| 4.285132379496351 | 5.398 | 3.942 | 3.269 |
| 4.28827397214994 | 5.402 | 3.945 | 3.27 |
| 4.29141556480353 | 5.407 | 3.948 | 3.272 |
| 4.294557157457119 | 5.412 | 3.95 | 3.274 |
| 4.29769875011071 | 5.416 | 3.953 | 3.276 |
| 4.300840342764299 | 5.421 | 3.956 | 3.278 |
| 4.303981935417888 | 5.426 | 3.958 | 3.28 |
| 4.307123528071478 | 5.431 | 3.961 | 3.282 |
| 4.310265120725067 | 5.435 | 3.964 | 3.284 |
| 4.313406713378657 | 5.44 | 3.966 | 3.285 |
| 4.316548306032247 | 5.445 | 3.969 | 3.287 |
| 4.319689898685836 | 5.45 | 3.972 | 3.289 |
| 4.322831491339426 | 5.454 | 3.974 | 3.291 |
| 4.325973083993015 | 5.459 | 3.977 | 3.293 |
| 4.329114676646605 | 5.464 | 3.98 | 3.295 |
| 4.332256269300195 | 5.469 | 3.983 | 3.297 |
| 4.335397861953784 | 5.474 | 3.985 | 3.299 |
| 4.338539454607374 | 5.478 | 3.988 | 3.3 |
| 4.341681047260963 | 5.483 | 3.991 | 3.302 |
| 4.344822639914553 | 5.488 | 3.993 | 3.304 |
| 4.347964232568143 | 5.493 | 3.996 | 3.306 |
| 4.351105825221732 | 5.498 | 3.999 | 3.308 |
| 4.354247417875322 | 5.503 | 4.001 | 3.31 |
| 4.357389010528911 | 5.507 | 4.004 | 3.311 |
| 4.360530603182501 | 5.512 | 4.007 | 3.313 |
| 4.36367219583609 | 5.517 | 4.009 | 3.315 |
| 4.36681378848968 | 5.522 | 4.012 | 3.317 |
| 4.36995538114327 | 5.527 | 4.015 | 3.319 |
| 4.373096973796859 | 5.532 | 4.017 | 3.321 |
| 4.376238566450449 | 5.537 | 4.02 | 3.323 |
| 4.379380159104038 | 5.541 | 4.023 | 3.324 |
| 4.382521751757628 | 5.546 | 4.025 | 3.326 |
| 4.385663344411217 | 5.551 | 4.028 | 3.328 |
| 4.388804937064807 | 5.556 | 4.031 | 3.33 |
| 4.391946529718397 | 5.561 | 4.033 | 3.332 |
| 4.395088122371987 | 5.566 | 4.036 | 3.333 |
| 4.398229715025576 | 5.571 | 4.039 | 3.335 |
| 4.401371307679165 | 5.576 | 4.041 | 3.337 |
| 4.404512900332755 | 5.581 | 4.044 | 3.339 |
| 4.407654492986345 | 5.586 | 4.047 | 3.341 |
| 4.410796085639934 | 5.591 | 4.049 | 3.343 |
| 4.413937678293524 | 5.596 | 4.052 | 3.344 |
| 4.417079270947114 | 5.601 | 4.055 | 3.346 |
| 4.420220863600703 | 5.606 | 4.057 | 3.348 |
| 4.423362456254293 | 5.61 | 4.06 | 3.35 |
| 4.426504048907883 | 5.615 | 4.062 | 3.352 |
| 4.429645641561472 | 5.62 | 4.065 | 3.353 |
| 4.432787234215062 | 5.625 | 4.068 | 3.355 |
| 4.435928826868651 | 5.63 | 4.07 | 3.357 |
| 4.43907041952224 | 5.635 | 4.073 | 3.359 |
| 4.44221201217583 | 5.64 | 4.076 | 3.361 |
| 4.44535360482942 | 5.645 | 4.078 | 3.362 |
| 4.44849519748301 | 5.65 | 4.081 | 3.364 |
| 4.4516367901366 | 5.655 | 4.084 | 3.366 |
| 4.454778382790188 | 5.66 | 4.086 | 3.368 |
| 4.457919975443779 | 5.665 | 4.089 | 3.37 |
| 4.461061568097368 | 5.67 | 4.092 | 3.371 |
| 4.464203160750958 | 5.675 | 4.094 | 3.373 |
| 4.467344753404547 | 5.681 | 4.097 | 3.375 |
| 4.470486346058137 | 5.686 | 4.1 | 3.377 |
| 4.473627938711726 | 5.691 | 4.102 | 3.379 |
| 4.476769531365316 | 5.696 | 4.105 | 3.38 |
| 4.479911124018905 | 5.701 | 4.107 | 3.382 |
| 4.483052716672495 | 5.706 | 4.11 | 3.384 |
| 4.486194309326085 | 5.711 | 4.113 | 3.386 |
| 4.489335901979674 | 5.716 | 4.115 | 3.388 |
| 4.492477494633264 | 5.721 | 4.118 | 3.389 |
| 4.495619087286854 | 5.726 | 4.121 | 3.391 |
| 4.498760679940443 | 5.731 | 4.123 | 3.393 |
| 4.501902272594033 | 5.736 | 4.126 | 3.395 |
| 4.505043865247622 | 5.741 | 4.129 | 3.396 |
| 4.508185457901212 | 5.746 | 4.131 | 3.398 |
| 4.511327050554801 | 5.752 | 4.134 | 3.4 |
| 4.514468643208391 | 5.757 | 4.137 | 3.402 |
| 4.517610235861981 | 5.762 | 4.139 | 3.404 |
| 4.520751828515571 | 5.767 | 4.142 | 3.405 |
| 4.52389342116916 | 5.772 | 4.144 | 3.407 |
| 4.52703501382275 | 5.777 | 4.147 | 3.409 |
| 4.530176606476339 | 5.782 | 4.15 | 3.411 |
| 4.533318199129928 | 5.787 | 4.152 | 3.412 |
| 4.536459791783518 | 5.792 | 4.155 | 3.414 |
| 4.539601384437108 | 5.798 | 4.158 | 3.416 |
| 4.542742977090698 | 5.803 | 4.16 | 3.418 |
| 4.545884569744287 | 5.808 | 4.163 | 3.42 |
| 4.549026162397876 | 5.813 | 4.165 | 3.421 |
| 4.552167755051466 | 5.818 | 4.168 | 3.423 |
| 4.555309347705056 | 5.823 | 4.171 | 3.425 |
| 4.558450940358646 | 5.828 | 4.173 | 3.427 |
| 4.561592533012235 | 5.834 | 4.176 | 3.428 |
| 4.564734125665825 | 5.839 | 4.179 | 3.43 |
| 4.567875718319415 | 5.844 | 4.181 | 3.432 |
| 4.571017310973004 | 5.849 | 4.184 | 3.434 |
| 4.574158903626594 | 5.854 | 4.186 | 3.435 |
| 4.577300496280183 | 5.859 | 4.189 | 3.437 |
| 4.580442088933772 | 5.865 | 4.192 | 3.439 |
| 4.583583681587362 | 5.87 | 4.194 | 3.441 |
| 4.586725274240952 | 5.875 | 4.197 | 3.442 |
| 4.589866866894542 | 5.88 | 4.2 | 3.444 |
| 4.593008459548131 | 5.885 | 4.202 | 3.446 |
| 4.596150052201721 | 5.891 | 4.205 | 3.448 |
| 4.59929164485531 | 5.896 | 4.207 | 3.449 |
| 4.6024332375089 | 5.901 | 4.21 | 3.451 |
| 4.60557483016249 | 5.906 | 4.213 | 3.453 |
| 4.608716422816079 | 5.911 | 4.215 | 3.455 |
| 4.611858015469668 | 5.916 | 4.218 | 3.456 |
| 4.614999608123258 | 5.922 | 4.221 | 3.458 |
| 4.618141200776848 | 5.927 | 4.223 | 3.46 |
| 4.621282793430437 | 5.932 | 4.226 | 3.462 |
| 4.624424386084027 | 5.937 | 4.228 | 3.463 |
| 4.627565978737617 | 5.943 | 4.231 | 3.465 |
| 4.630707571391206 | 5.948 | 4.234 | 3.467 |
| 4.633849164044795 | 5.953 | 4.236 | 3.469 |
| 4.636990756698386 | 5.958 | 4.239 | 3.47 |
| 4.640132349351975 | 5.963 | 4.242 | 3.472 |
| 4.643273942005564 | 5.969 | 4.244 | 3.474 |
| 4.646415534659154 | 5.974 | 4.247 | 3.476 |
| 4.649557127312744 | 5.979 | 4.249 | 3.477 |
| 4.652698719966334 | 5.984 | 4.252 | 3.479 |
| 4.655840312619923 | 5.989 | 4.255 | 3.481 |
| 4.658981905273513 | 5.995 | 4.257 | 3.483 |
| 4.662123497927102 | 6 | 4.26 | 3.484 |
| 4.665265090580692 | 6.005 | 4.263 | 3.486 |
| 4.668406683234282 | 6.01 | 4.265 | 3.488 |
| 4.671548275887871 | 6.016 | 4.268 | 3.49 |
| 4.674689868541461 | 6.021 | 4.27 | 3.491 |
| 4.67783146119505 | 6.026 | 4.273 | 3.493 |
| 4.68097305384864 | 6.031 | 4.276 | 3.495 |
| 4.68411464650223 | 6.037 | 4.278 | 3.497 |
| 4.687256239155819 | 6.042 | 4.281 | 3.498 |
| 4.690397831809409 | 6.047 | 4.283 | 3.5 |
| 4.693539424462998 | 6.052 | 4.286 | 3.502 |
| 4.696681017116588 | 6.057 | 4.289 | 3.504 |
| 4.699822609770177 | 6.063 | 4.291 | 3.505 |
| 4.702964202423767 | 6.068 | 4.294 | 3.507 |
| 4.706105795077356 | 6.073 | 4.297 | 3.509 |
| 4.709247387730946 | 6.078 | 4.299 | 3.511 |
| 4.712388980384535 | 6.084 | 4.302 | 3.512 |
| 4.715530573038126 | 6.089 | 4.304 | 3.514 |
| 4.718672165691715 | 6.094 | 4.307 | 3.516 |
| 4.721813758345305 | 6.099 | 4.31 | 3.518 |
| 4.724955350998894 | 6.105 | 4.312 | 3.519 |
| 4.728096943652484 | 6.11 | 4.315 | 3.521 |
| 4.731238536306074 | 6.115 | 4.318 | 3.523 |
| 4.734380128959663 | 6.12 | 4.32 | 3.525 |
| 4.737521721613253 | 6.126 | 4.323 | 3.526 |
| 4.740663314266842 | 6.131 | 4.325 | 3.528 |
| 4.743804906920432 | 6.136 | 4.328 | 3.53 |
| 4.74694649957402 | 6.141 | 4.331 | 3.532 |
| 4.750088092227611 | 6.146 | 4.333 | 3.533 |
| 4.7532296848812 | 6.152 | 4.336 | 3.535 |
| 4.75637127753479 | 6.157 | 4.338 | 3.537 |
| 4.75951287018838 | 6.162 | 4.341 | 3.539 |
| 4.76265446284197 | 6.167 | 4.344 | 3.54 |
| 4.765796055495559 | 6.173 | 4.346 | 3.542 |
| 4.768937648149149 | 6.178 | 4.349 | 3.544 |
| 4.772079240802738 | 6.183 | 4.352 | 3.546 |
| 4.775220833456327 | 6.188 | 4.354 | 3.547 |
| 4.778362426109917 | 6.194 | 4.357 | 3.549 |
| 4.781504018763507 | 6.199 | 4.359 | 3.551 |
| 4.784645611417097 | 6.204 | 4.362 | 3.553 |
| 4.787787204070686 | 6.209 | 4.365 | 3.554 |
| 4.790928796724275 | 6.214 | 4.367 | 3.556 |
| 4.794070389377865 | 6.22 | 4.37 | 3.558 |
| 4.797211982031455 | 6.225 | 4.373 | 3.56 |
| 4.800353574685045 | 6.23 | 4.375 | 3.561 |
| 4.803495167338634 | 6.235 | 4.378 | 3.563 |
| 4.806636759992224 | 6.24 | 4.38 | 3.565 |
| 4.809778352645814 | 6.246 | 4.383 | 3.567 |
| 4.812919945299403 | 6.251 | 4.386 | 3.568 |
| 4.816061537952993 | 6.256 | 4.388 | 3.57 |
| 4.819203130606582 | 6.261 | 4.391 | 3.572 |
| 4.822344723260172 | 6.266 | 4.393 | 3.574 |
| 4.825486315913761 | 6.272 | 4.396 | 3.575 |
| 4.828627908567351 | 6.277 | 4.399 | 3.577 |
| 4.83176950122094 | 6.282 | 4.401 | 3.579 |
| 4.83491109387453 | 6.287 | 4.404 | 3.581 |
| 4.83805268652812 | 6.292 | 4.407 | 3.582 |
| 4.841194279181709 | 6.298 | 4.409 | 3.584 |
| 4.844335871835299 | 6.303 | 4.412 | 3.586 |
| 4.847477464488889 | 6.308 | 4.414 | 3.588 |
| 4.850619057142478 | 6.313 | 4.417 | 3.589 |
| 4.853760649796068 | 6.318 | 4.42 | 3.591 |
| 4.856902242449657 | 6.323 | 4.422 | 3.593 |
| 4.860043835103247 | 6.329 | 4.425 | 3.595 |
| 4.863185427756837 | 6.334 | 4.428 | 3.596 |
| 4.866327020410426 | 6.339 | 4.43 | 3.598 |
| 4.869468613064015 | 6.344 | 4.433 | 3.6 |
| 4.872610205717605 | 6.349 | 4.436 | 3.602 |
| 4.875751798371195 | 6.354 | 4.438 | 3.604 |
| 4.878893391024784 | 6.359 | 4.441 | 3.605 |
| 4.882034983678374 | 6.365 | 4.443 | 3.607 |
| 4.885176576331964 | 6.37 | 4.446 | 3.609 |
| 4.888318168985553 | 6.375 | 4.449 | 3.611 |
| 4.891459761639143 | 6.38 | 4.451 | 3.612 |
| 4.894601354292733 | 6.385 | 4.454 | 3.614 |
| 4.897742946946322 | 6.39 | 4.457 | 3.616 |
| 4.900884539599912 | 6.395 | 4.459 | 3.618 |
| 4.904026132253501 | 6.401 | 4.462 | 3.619 |
| 4.907167724907091 | 6.406 | 4.464 | 3.621 |
| 4.91030931756068 | 6.411 | 4.467 | 3.623 |
| 4.91345091021427 | 6.416 | 4.47 | 3.625 |
| 4.91659250286786 | 6.421 | 4.472 | 3.627 |
| 4.91973409552145 | 6.426 | 4.475 | 3.628 |
| 4.922875688175039 | 6.431 | 4.478 | 3.63 |
| 4.926017280828628 | 6.436 | 4.48 | 3.632 |
| 4.929158873482218 | 6.441 | 4.483 | 3.634 |
| 4.932300466135808 | 6.446 | 4.486 | 3.635 |
| 4.935442058789397 | 6.451 | 4.488 | 3.637 |
| 4.938583651442987 | 6.457 | 4.491 | 3.639 |
| 4.941725244096576 | 6.462 | 4.493 | 3.641 |
| 4.944866836750166 | 6.467 | 4.496 | 3.643 |
| 4.948008429403755 | 6.472 | 4.499 | 3.644 |
| 4.951150022057345 | 6.477 | 4.501 | 3.646 |
| 4.954291614710935 | 6.482 | 4.504 | 3.648 |
| 4.957433207364524 | 6.487 | 4.507 | 3.65 |
| 4.960574800018114 | 6.492 | 4.509 | 3.652 |
| 4.963716392671704 | 6.497 | 4.512 | 3.653 |
| 4.966857985325293 | 6.502 | 4.515 | 3.655 |
| 4.969999577978883 | 6.507 | 4.517 | 3.657 |
| 4.973141170632472 | 6.512 | 4.52 | 3.659 |
| 4.976282763286062 | 6.517 | 4.523 | 3.661 |
| 4.979424355939651 | 6.522 | 4.525 | 3.662 |
| 4.982565948593241 | 6.527 | 4.528 | 3.664 |
| 4.985707541246831 | 6.532 | 4.531 | 3.666 |
| 4.98884913390042 | 6.537 | 4.533 | 3.668 |
| 4.99199072655401 | 6.542 | 4.536 | 3.67 |
| 4.9951323192076 | 6.547 | 4.538 | 3.671 |
| 4.99827391186119 | 6.552 | 4.541 | 3.673 |
| 5.00141550451478 | 6.557 | 4.544 | 3.675 |
| 5.004557097168369 | 6.562 | 4.546 | 3.677 |
| 5.007698689821958 | 6.567 | 4.549 | 3.679 |
| 5.010840282475548 | 6.572 | 4.552 | 3.68 |
| 5.013981875129137 | 6.577 | 4.554 | 3.682 |
| 5.017123467782727 | 6.582 | 4.557 | 3.684 |
| 5.020265060436317 | 6.587 | 4.56 | 3.686 |
| 5.023406653089906 | 6.591 | 4.562 | 3.688 |
| 5.026548245743496 | 6.596 | 4.565 | 3.69 |
| 5.029689838397085 | 6.601 | 4.568 | 3.691 |
| 5.032831431050674 | 6.606 | 4.57 | 3.693 |
| 5.035973023704264 | 6.611 | 4.573 | 3.695 |
| 5.039114616357854 | 6.616 | 4.576 | 3.697 |
| 5.042256209011444 | 6.621 | 4.578 | 3.699 |
| 5.045397801665033 | 6.626 | 4.581 | 3.7 |
| 5.048539394318622 | 6.631 | 4.584 | 3.702 |
| 5.051680986972213 | 6.636 | 4.586 | 3.704 |
| 5.054822579625802 | 6.64 | 4.589 | 3.706 |
| 5.057964172279392 | 6.645 | 4.592 | 3.708 |
| 5.061105764932981 | 6.65 | 4.594 | 3.71 |
| 5.064247357586571 | 6.655 | 4.597 | 3.711 |
| 5.067388950240161 | 6.66 | 4.6 | 3.713 |
| 5.07053054289375 | 6.665 | 4.602 | 3.715 |
| 5.07367213554734 | 6.67 | 4.605 | 3.717 |
| 5.07681372820093 | 6.674 | 4.608 | 3.719 |
| 5.079955320854519 | 6.679 | 4.61 | 3.721 |
| 5.083096913508108 | 6.684 | 4.613 | 3.723 |
| 5.086238506161698 | 6.689 | 4.616 | 3.724 |
| 5.089380098815288 | 6.694 | 4.618 | 3.726 |
| 5.092521691468877 | 6.698 | 4.621 | 3.728 |
| 5.095663284122466 | 6.703 | 4.624 | 3.73 |
| 5.098804876776057 | 6.708 | 4.626 | 3.732 |
| 5.101946469429646 | 6.713 | 4.629 | 3.734 |
| 5.105088062083236 | 6.718 | 4.632 | 3.736 |
| 5.108229654736825 | 6.722 | 4.634 | 3.737 |
| 5.111371247390415 | 6.727 | 4.637 | 3.739 |
| 5.114512840044005 | 6.732 | 4.64 | 3.741 |
| 5.117654432697594 | 6.737 | 4.643 | 3.743 |
| 5.120796025351184 | 6.741 | 4.645 | 3.745 |
| 5.123937618004773 | 6.746 | 4.648 | 3.747 |
| 5.127079210658363 | 6.751 | 4.651 | 3.749 |
| 5.130220803311953 | 6.756 | 4.653 | 3.751 |
| 5.133362395965542 | 6.76 | 4.656 | 3.752 |
| 5.136503988619131 | 6.765 | 4.659 | 3.754 |
| 5.13964558127272 | 6.77 | 4.661 | 3.756 |
| 5.142787173926311 | 6.774 | 4.664 | 3.758 |
| 5.1459287665799 | 6.779 | 4.667 | 3.76 |
| 5.14907035923349 | 6.784 | 4.669 | 3.762 |
| 5.15221195188708 | 6.788 | 4.672 | 3.764 |
| 5.15535354454067 | 6.793 | 4.675 | 3.766 |
| 5.158495137194259 | 6.798 | 4.678 | 3.768 |
| 5.161636729847848 | 6.802 | 4.68 | 3.77 |
| 5.164778322501438 | 6.807 | 4.683 | 3.771 |
| 5.167919915155028 | 6.812 | 4.686 | 3.773 |
| 5.171061507808617 | 6.816 | 4.688 | 3.775 |
| 5.174203100462206 | 6.821 | 4.691 | 3.777 |
| 5.177344693115796 | 6.826 | 4.694 | 3.779 |
| 5.180486285769386 | 6.83 | 4.697 | 3.781 |
| 5.183627878422976 | 6.835 | 4.699 | 3.783 |
| 5.186769471076565 | 6.839 | 4.702 | 3.785 |
| 5.189911063730155 | 6.844 | 4.705 | 3.787 |
| 5.193052656383744 | 6.849 | 4.707 | 3.789 |
| 5.196194249037334 | 6.853 | 4.71 | 3.791 |
| 5.199335841690924 | 6.858 | 4.713 | 3.793 |
| 5.202477434344513 | 6.862 | 4.716 | 3.795 |
| 5.205619026998103 | 6.867 | 4.718 | 3.796 |
| 5.208760619651692 | 6.871 | 4.721 | 3.798 |
| 5.211902212305282 | 6.876 | 4.724 | 3.8 |
| 5.215043804958871 | 6.881 | 4.726 | 3.802 |
| 5.218185397612461 | 6.885 | 4.729 | 3.804 |
| 5.221326990266051 | 6.89 | 4.732 | 3.806 |
| 5.22446858291964 | 6.894 | 4.735 | 3.808 |
| 5.22761017557323 | 6.899 | 4.737 | 3.81 |
| 5.23075176822682 | 6.903 | 4.74 | 3.812 |
| 5.23389336088041 | 6.908 | 4.743 | 3.814 |
| 5.237034953533999 | 6.912 | 4.746 | 3.816 |
| 5.240176546187588 | 6.917 | 4.748 | 3.818 |
| 5.243318138841178 | 6.921 | 4.751 | 3.82 |
| 5.246459731494767 | 6.925 | 4.754 | 3.822 |
| 5.249601324148357 | 6.93 | 4.756 | 3.824 |
| 5.252742916801947 | 6.934 | 4.759 | 3.826 |
| 5.255884509455536 | 6.939 | 4.762 | 3.828 |
| 5.259026102109125 | 6.943 | 4.765 | 3.83 |
| 5.262167694762715 | 6.948 | 4.767 | 3.832 |
| 5.265309287416305 | 6.952 | 4.77 | 3.834 |
| 5.268450880069895 | 6.957 | 4.773 | 3.836 |
| 5.271592472723484 | 6.961 | 4.776 | 3.838 |
| 5.274734065377074 | 6.965 | 4.778 | 3.84 |
| 5.277875658030664 | 6.97 | 4.781 | 3.842 |
| 5.281017250684253 | 6.974 | 4.784 | 3.844 |
| 5.284158843337843 | 6.979 | 4.787 | 3.846 |
| 5.287300435991432 | 6.983 | 4.789 | 3.848 |
| 5.290442028645022 | 6.987 | 4.792 | 3.85 |
| 5.293583621298612 | 6.992 | 4.795 | 3.852 |
| 5.296725213952201 | 6.996 | 4.798 | 3.854 |
| 5.299866806605791 | 7 | 4.8 | 3.856 |
| 5.30300839925938 | 7.005 | 4.803 | 3.858 |
| 5.30614999191297 | 7.009 | 4.806 | 3.86 |
| 5.30929158456656 | 7.013 | 4.809 | 3.862 |
| 5.312433177220149 | 7.018 | 4.811 | 3.864 |
| 5.315574769873739 | 7.022 | 4.814 | 3.866 |
| 5.318716362527328 | 7.026 | 4.817 | 3.868 |
| 5.321857955180918 | 7.031 | 4.82 | 3.87 |
| 5.324999547834508 | 7.035 | 4.823 | 3.872 |
| 5.328141140488097 | 7.039 | 4.825 | 3.874 |
| 5.331282733141686 | 7.044 | 4.828 | 3.876 |
| 5.334424325795276 | 7.048 | 4.831 | 3.878 |
| 5.337565918448866 | 7.052 | 4.834 | 3.88 |
| 5.340707511102456 | 7.056 | 4.836 | 3.882 |
| 5.343849103756045 | 7.061 | 4.839 | 3.884 |
| 5.346990696409634 | 7.065 | 4.842 | 3.886 |
| 5.350132289063224 | 7.069 | 4.845 | 3.889 |
| 5.353273881716814 | 7.073 | 4.848 | 3.891 |
| 5.356415474370403 | 7.077 | 4.85 | 3.893 |
| 5.359557067023993 | 7.082 | 4.853 | 3.895 |
| 5.362698659677583 | 7.086 | 4.856 | 3.897 |
| 5.365840252331172 | 7.09 | 4.859 | 3.899 |
| 5.368981844984762 | 7.094 | 4.861 | 3.901 |
| 5.372123437638351 | 7.099 | 4.864 | 3.903 |
| 5.375265030291941 | 7.103 | 4.867 | 3.905 |
| 5.378406622945531 | 7.107 | 4.87 | 3.907 |
| 5.38154821559912 | 7.111 | 4.873 | 3.909 |
| 5.38468980825271 | 7.115 | 4.875 | 3.912 |
| 5.387831400906299 | 7.119 | 4.878 | 3.914 |
| 5.39097299355989 | 7.124 | 4.881 | 3.916 |
| 5.394114586213479 | 7.128 | 4.884 | 3.918 |
| 5.397256178867068 | 7.132 | 4.887 | 3.92 |
| 5.400397771520657 | 7.136 | 4.889 | 3.922 |
| 5.403539364174247 | 7.14 | 4.892 | 3.924 |
| 5.406680956827837 | 7.144 | 4.895 | 3.926 |
| 5.409822549481426 | 7.148 | 4.898 | 3.929 |
| 5.412964142135016 | 7.152 | 4.901 | 3.931 |
| 5.416105734788605 | 7.156 | 4.904 | 3.933 |
| 5.419247327442195 | 7.161 | 4.906 | 3.935 |
| 5.422388920095785 | 7.165 | 4.909 | 3.937 |
| 5.425530512749375 | 7.169 | 4.912 | 3.939 |
| 5.428672105402964 | 7.173 | 4.915 | 3.941 |
| 5.431813698056554 | 7.177 | 4.918 | 3.944 |
| 5.434955290710143 | 7.181 | 4.92 | 3.946 |
| 5.438096883363733 | 7.185 | 4.923 | 3.948 |
| 5.441238476017322 | 7.189 | 4.926 | 3.95 |
| 5.444380068670912 | 7.193 | 4.929 | 3.952 |
| 5.447521661324502 | 7.197 | 4.932 | 3.954 |
| 5.450663253978091 | 7.201 | 4.935 | 3.957 |
| 5.453804846631681 | 7.205 | 4.937 | 3.959 |
| 5.456946439285271 | 7.209 | 4.94 | 3.961 |
| 5.46008803193886 | 7.213 | 4.943 | 3.963 |
| 5.46322962459245 | 7.217 | 4.946 | 3.965 |
| 5.466371217246039 | 7.221 | 4.949 | 3.968 |
| 5.46951280989963 | 7.225 | 4.952 | 3.97 |
| 5.472654402553218 | 7.229 | 4.954 | 3.972 |
| 5.475795995206808 | 7.233 | 4.957 | 3.974 |
| 5.478937587860398 | 7.237 | 4.96 | 3.976 |
| 5.482079180513987 | 7.241 | 4.963 | 3.979 |
| 5.485220773167577 | 7.245 | 4.966 | 3.981 |
| 5.488362365821166 | 7.249 | 4.969 | 3.983 |
| 5.491503958474756 | 7.253 | 4.972 | 3.985 |
| 5.494645551128346 | 7.257 | 4.974 | 3.988 |
| 5.497787143781935 | 7.261 | 4.977 | 3.99 |
| 5.500928736435525 | 7.265 | 4.98 | 3.992 |
| 5.504070329089115 | 7.269 | 4.983 | 3.994 |
| 5.507211921742704 | 7.272 | 4.986 | 3.997 |
| 5.510353514396294 | 7.276 | 4.989 | 3.999 |
| 5.513495107049883 | 7.28 | 4.992 | 4.001 |
| 5.516636699703473 | 7.284 | 4.994 | 4.003 |
| 5.519778292357062 | 7.288 | 4.997 | 4.006 |
| 5.522919885010652 | 7.292 | 5 | 4.008 |
| 5.526061477664242 | 7.296 | 5.003 | 4.01 |
| 5.529203070317831 | 7.3 | 5.006 | 4.012 |
| 5.532344662971421 | 7.304 | 5.009 | 4.015 |
| 5.535486255625011 | 7.307 | 5.012 | 4.017 |
| 5.5386278482786 | 7.311 | 5.014 | 4.019 |
| 5.54176944093219 | 7.315 | 5.017 | 4.022 |
| 5.544911033585779 | 7.319 | 5.02 | 4.024 |
| 5.54805262623937 | 7.323 | 5.023 | 4.026 |
| 5.551194218892959 | 7.327 | 5.026 | 4.029 |
| 5.554335811546548 | 7.33 | 5.029 | 4.031 |
| 5.557477404200137 | 7.334 | 5.032 | 4.033 |
| 5.560618996853727 | 7.338 | 5.035 | 4.036 |
| 5.563760589507317 | 7.342 | 5.038 | 4.038 |
| 5.566902182160906 | 7.346 | 5.04 | 4.04 |
| 5.570043774814496 | 7.349 | 5.043 | 4.043 |
| 5.573185367468086 | 7.353 | 5.046 | 4.045 |
| 5.576326960121675 | 7.357 | 5.049 | 4.047 |
| 5.579468552775264 | 7.361 | 5.052 | 4.05 |
| 5.582610145428854 | 7.365 | 5.055 | 4.052 |
| 5.585751738082444 | 7.368 | 5.058 | 4.054 |
| 5.588893330736034 | 7.372 | 5.061 | 4.057 |
| 5.592034923389623 | 7.376 | 5.064 | 4.059 |
| 5.595176516043213 | 7.38 | 5.067 | 4.061 |
| 5.598318108696803 | 7.383 | 5.069 | 4.064 |
| 5.601459701350392 | 7.387 | 5.072 | 4.066 |
| 5.604601294003982 | 7.391 | 5.075 | 4.069 |
| 5.607742886657571 | 7.395 | 5.078 | 4.071 |
| 5.610884479311161 | 7.398 | 5.081 | 4.073 |
| 5.61402607196475 | 7.402 | 5.084 | 4.076 |
| 5.61716766461834 | 7.406 | 5.087 | 4.078 |
| 5.62030925727193 | 7.409 | 5.09 | 4.081 |
| 5.623450849925519 | 7.413 | 5.093 | 4.083 |
| 5.626592442579109 | 7.417 | 5.096 | 4.085 |
| 5.629734035232698 | 7.42 | 5.099 | 4.088 |
| 5.632875627886288 | 7.424 | 5.102 | 4.09 |
| 5.636017220539878 | 7.428 | 5.104 | 4.093 |
| 5.639158813193467 | 7.432 | 5.107 | 4.095 |
| 5.642300405847057 | 7.435 | 5.11 | 4.098 |
| 5.645441998500646 | 7.439 | 5.113 | 4.1 |
| 5.648583591154236 | 7.442 | 5.116 | 4.102 |
| 5.651725183807825 | 7.446 | 5.119 | 4.105 |
| 5.654866776461415 | 7.45 | 5.122 | 4.107 |
| 5.658008369115005 | 7.453 | 5.125 | 4.11 |
| 5.661149961768594 | 7.457 | 5.128 | 4.112 |
| 5.664291554422184 | 7.461 | 5.131 | 4.115 |
| 5.667433147075774 | 7.464 | 5.134 | 4.117 |
| 5.670574739729363 | 7.468 | 5.137 | 4.12 |
| 5.673716332382953 | 7.472 | 5.14 | 4.122 |
| 5.676857925036542 | 7.475 | 5.143 | 4.125 |
| 5.679999517690132 | 7.479 | 5.146 | 4.127 |
| 5.683141110343721 | 7.482 | 5.149 | 4.13 |
| 5.686282702997311 | 7.486 | 5.152 | 4.132 |
| 5.689424295650901 | 7.49 | 5.155 | 4.135 |
| 5.69256588830449 | 7.493 | 5.157 | 4.137 |
| 5.69570748095808 | 7.497 | 5.16 | 4.14 |
| 5.69884907361167 | 7.5 | 5.163 | 4.142 |
| 5.701990666265259 | 7.504 | 5.166 | 4.145 |
| 5.705132258918849 | 7.507 | 5.169 | 4.147 |
| 5.708273851572438 | 7.511 | 5.172 | 4.15 |
| 5.711415444226028 | 7.515 | 5.175 | 4.152 |
| 5.714557036879618 | 7.518 | 5.178 | 4.155 |
| 5.717698629533207 | 7.522 | 5.181 | 4.157 |
| 5.720840222186797 | 7.525 | 5.184 | 4.16 |
| 5.723981814840386 | 7.529 | 5.187 | 4.163 |
| 5.727123407493976 | 7.532 | 5.19 | 4.165 |
| 5.730265000147565 | 7.536 | 5.193 | 4.168 |
| 5.733406592801155 | 7.539 | 5.196 | 4.17 |
| 5.736548185454744 | 7.543 | 5.199 | 4.173 |
| 5.739689778108334 | 7.546 | 5.202 | 4.175 |
| 5.742831370761924 | 7.55 | 5.205 | 4.178 |
| 5.745972963415514 | 7.553 | 5.208 | 4.181 |
| 5.749114556069103 | 7.557 | 5.211 | 4.183 |
| 5.752256148722693 | 7.56 | 5.214 | 4.186 |
| 5.755397741376282 | 7.564 | 5.217 | 4.188 |
| 5.758539334029872 | 7.567 | 5.22 | 4.191 |
| 5.761680926683462 | 7.571 | 5.223 | 4.194 |
| 5.764822519337051 | 7.574 | 5.226 | 4.196 |
| 5.767964111990641 | 7.578 | 5.229 | 4.199 |
| 5.77110570464423 | 7.581 | 5.232 | 4.202 |
| 5.77424729729782 | 7.585 | 5.235 | 4.204 |
| 5.77738888995141 | 7.588 | 5.238 | 4.207 |
| 5.780530482605 | 7.592 | 5.241 | 4.21 |
| 5.783672075258588 | 7.595 | 5.244 | 4.212 |
| 5.786813667912178 | 7.599 | 5.247 | 4.215 |
| 5.789955260565768 | 7.602 | 5.25 | 4.218 |
| 5.793096853219358 | 7.606 | 5.253 | 4.22 |
| 5.796238445872947 | 7.609 | 5.256 | 4.223 |
| 5.799380038526537 | 7.613 | 5.259 | 4.226 |
| 5.802521631180126 | 7.616 | 5.262 | 4.228 |
| 5.805663223833715 | 7.619 | 5.265 | 4.231 |
| 5.808804816487306 | 7.623 | 5.268 | 4.234 |
| 5.811946409140895 | 7.626 | 5.271 | 4.236 |
| 5.815088001794485 | 7.63 | 5.274 | 4.239 |
| 5.818229594448074 | 7.633 | 5.277 | 4.242 |
| 5.821371187101663 | 7.637 | 5.28 | 4.244 |
| 5.824512779755254 | 7.64 | 5.283 | 4.247 |
| 5.827654372408843 | 7.643 | 5.286 | 4.25 |
| 5.830795965062433 | 7.647 | 5.289 | 4.253 |
| 5.833937557716022 | 7.65 | 5.292 | 4.255 |
| 5.837079150369612 | 7.654 | 5.295 | 4.258 |
| 5.840220743023201 | 7.657 | 5.298 | 4.261 |
| 5.843362335676791 | 7.66 | 5.301 | 4.263 |
| 5.846503928330381 | 7.664 | 5.304 | 4.266 |
| 5.84964552098397 | 7.667 | 5.307 | 4.269 |
| 5.85278711363756 | 7.67 | 5.31 | 4.272 |
| 5.85592870629115 | 7.674 | 5.313 | 4.274 |
| 5.85907029894474 | 7.677 | 5.316 | 4.277 |
| 5.862211891598329 | 7.681 | 5.319 | 4.28 |
| 5.865353484251918 | 7.684 | 5.323 | 4.283 |
| 5.868495076905508 | 7.687 | 5.326 | 4.286 |
| 5.871636669559098 | 7.691 | 5.329 | 4.288 |
| 5.874778262212687 | 7.694 | 5.332 | 4.291 |
| 5.877919854866277 | 7.697 | 5.335 | 4.294 |
| 5.881061447519866 | 7.701 | 5.338 | 4.297 |
| 5.884203040173456 | 7.704 | 5.341 | 4.3 |
| 5.887344632827046 | 7.707 | 5.344 | 4.302 |
| 5.890486225480635 | 7.711 | 5.347 | 4.305 |
| 5.893627818134224 | 7.714 | 5.35 | 4.308 |
| 5.896769410787814 | 7.717 | 5.353 | 4.311 |
| 5.899911003441404 | 7.721 | 5.356 | 4.314 |
| 5.903052596094994 | 7.724 | 5.359 | 4.316 |
| 5.906194188748583 | 7.727 | 5.362 | 4.319 |
| 5.909335781402172 | 7.731 | 5.365 | 4.322 |
| 5.912477374055762 | 7.734 | 5.368 | 4.325 |
| 5.915618966709352 | 7.737 | 5.371 | 4.328 |
| 5.918760559362942 | 7.741 | 5.374 | 4.331 |
| 5.921902152016531 | 7.744 | 5.377 | 4.333 |
| 5.92504374467012 | 7.747 | 5.381 | 4.336 |
| 5.92818533732371 | 7.751 | 5.384 | 4.339 |
| 5.9313269299773 | 7.754 | 5.387 | 4.342 |
| 5.93446852263089 | 7.757 | 5.39 | 4.345 |
| 5.93761011528448 | 7.76 | 5.393 | 4.348 |
| 5.940751707938068 | 7.764 | 5.396 | 4.351 |
| 5.943893300591658 | 7.767 | 5.399 | 4.354 |
| 5.947034893245248 | 7.77 | 5.402 | 4.356 |
| 5.950176485898837 | 7.774 | 5.405 | 4.359 |
| 5.953318078552427 | 7.777 | 5.408 | 4.362 |
| 5.956459671206017 | 7.78 | 5.411 | 4.365 |
| 5.959601263859606 | 7.783 | 5.414 | 4.368 |
| 5.962742856513196 | 7.787 | 5.417 | 4.371 |
| 5.965884449166785 | 7.79 | 5.42 | 4.374 |
| 5.969026041820375 | 7.793 | 5.424 | 4.377 |
| 5.972167634473964 | 7.797 | 5.427 | 4.38 |
| 5.975309227127554 | 7.8 | 5.43 | 4.383 |
| 5.978450819781144 | 7.803 | 5.433 | 4.386 |
| 5.981592412434733 | 7.806 | 5.436 | 4.389 |
| 5.984734005088323 | 7.81 | 5.439 | 4.391 |
| 5.987875597741913 | 7.813 | 5.442 | 4.394 |
| 5.991017190395502 | 7.816 | 5.445 | 4.397 |
| 5.994158783049092 | 7.819 | 5.448 | 4.4 |
| 5.997300375702681 | 7.823 | 5.451 | 4.403 |
| 6.000441968356271 | 7.826 | 5.454 | 4.406 |
| 6.003583561009861 | 7.829 | 5.458 | 4.409 |
| 6.00672515366345 | 7.832 | 5.461 | 4.412 |
| 6.00986674631704 | 7.836 | 5.464 | 4.415 |
| 6.01300833897063 | 7.839 | 5.467 | 4.418 |
| 6.01614993162422 | 7.842 | 5.47 | 4.421 |
| 6.019291524277808 | 7.845 | 5.473 | 4.424 |
| 6.022433116931398 | 7.848 | 5.476 | 4.427 |
| 6.025574709584988 | 7.852 | 5.479 | 4.43 |
| 6.028716302238577 | 7.855 | 5.482 | 4.433 |
| 6.031857894892167 | 7.858 | 5.485 | 4.436 |
| 6.034999487545757 | 7.861 | 5.489 | 4.439 |
| 6.038141080199346 | 7.865 | 5.492 | 4.442 |
| 6.041282672852935 | 7.868 | 5.495 | 4.445 |
| 6.044424265506525 | 7.871 | 5.498 | 4.448 |
| 6.047565858160115 | 7.874 | 5.501 | 4.451 |
| 6.050707450813704 | 7.877 | 5.504 | 4.454 |
| 6.053849043467294 | 7.881 | 5.507 | 4.457 |
| 6.056990636120884 | 7.884 | 5.51 | 4.46 |
| 6.060132228774473 | 7.887 | 5.513 | 4.463 |
| 6.063273821428063 | 7.89 | 5.517 | 4.466 |
| 6.066415414081653 | 7.893 | 5.52 | 4.469 |
| 6.069557006735242 | 7.897 | 5.523 | 4.472 |
| 6.072698599388831 | 7.9 | 5.526 | 4.475 |
| 6.07584019204242 | 7.903 | 5.529 | 4.478 |
| 6.078981784696011 | 7.906 | 5.532 | 4.481 |
| 6.082123377349601 | 7.909 | 5.535 | 4.484 |
| 6.08526497000319 | 7.913 | 5.538 | 4.487 |
| 6.08840656265678 | 7.916 | 5.541 | 4.49 |
| 6.09154815531037 | 7.919 | 5.545 | 4.493 |
| 6.094689747963959 | 7.922 | 5.548 | 4.496 |
| 6.097831340617549 | 7.925 | 5.551 | 4.5 |
| 6.100972933271138 | 7.929 | 5.554 | 4.503 |
| 6.104114525924728 | 7.932 | 5.557 | 4.506 |
| 6.107256118578317 | 7.935 | 5.56 | 4.509 |
| 6.110397711231907 | 7.938 | 5.563 | 4.512 |
| 6.113539303885497 | 7.941 | 5.566 | 4.515 |
| 6.116680896539086 | 7.944 | 5.57 | 4.518 |
| 6.119822489192675 | 7.948 | 5.573 | 4.521 |
| 6.122964081846265 | 7.951 | 5.576 | 4.524 |
| 6.126105674499855 | 7.954 | 5.579 | 4.527 |
| 6.129247267153445 | 7.957 | 5.582 | 4.53 |
| 6.132388859807034 | 7.96 | 5.585 | 4.533 |
| 6.135530452460624 | 7.963 | 5.588 | 4.536 |
| 6.138672045114213 | 7.967 | 5.591 | 4.539 |
| 6.141813637767803 | 7.97 | 5.595 | 4.543 |
| 6.144955230421393 | 7.973 | 5.598 | 4.546 |
| 6.148096823074982 | 7.976 | 5.601 | 4.549 |
| 6.151238415728571 | 7.979 | 5.604 | 4.552 |
| 6.154380008382161 | 7.982 | 5.607 | 4.555 |
| 6.157521601035751 | 7.986 | 5.61 | 4.558 |
| 6.16066319368934 | 7.989 | 5.613 | 4.561 |
| 6.16380478634293 | 7.992 | 5.616 | 4.564 |
| 6.16694637899652 | 7.995 | 5.62 | 4.567 |
| 6.170087971650109 | 7.998 | 5.623 | 4.57 |
| 6.173229564303698 | 8.001 | 5.626 | 4.574 |
| 6.176371156957289 | 8.005 | 5.629 | 4.577 |
| 6.179512749610878 | 8.008 | 5.632 | 4.58 |
| 6.182654342264468 | 8.011 | 5.635 | 4.583 |
| 6.185795934918057 | 8.014 | 5.638 | 4.586 |
| 6.188937527571647 | 8.017 | 5.642 | 4.589 |
| 6.192079120225237 | 8.02 | 5.645 | 4.592 |
| 6.195220712878826 | 8.024 | 5.648 | 4.595 |
| 6.198362305532415 | 8.027 | 5.651 | 4.599 |
| 6.201503898186005 | 8.03 | 5.654 | 4.602 |
| 6.204645490839594 | 8.033 | 5.657 | 4.605 |
| 6.207787083493184 | 8.036 | 5.66 | 4.608 |
| 6.210928676146774 | 8.039 | 5.664 | 4.611 |
| 6.214070268800364 | 8.042 | 5.667 | 4.614 |
| 6.217211861453953 | 8.046 | 5.67 | 4.617 |
| 6.220353454107543 | 8.049 | 5.673 | 4.62 |
| 6.223495046761133 | 8.052 | 5.676 | 4.624 |
| 6.226636639414722 | 8.055 | 5.679 | 4.627 |
| 6.229778232068312 | 8.058 | 5.682 | 4.63 |
| 6.232919824721901 | 8.061 | 5.685 | 4.633 |
| 6.236061417375491 | 8.064 | 5.689 | 4.636 |
| 6.23920301002908 | 8.068 | 5.692 | 4.639 |
| 6.24234460268267 | 8.071 | 5.695 | 4.642 |
| 6.24548619533626 | 8.074 | 5.698 | 4.646 |
| 6.24862778798985 | 8.077 | 5.701 | 4.649 |
| 6.251769380643438 | 8.08 | 5.704 | 4.652 |
| 6.254910973297028 | 8.083 | 5.707 | 4.655 |
| 6.258052565950618 | 8.086 | 5.711 | 4.658 |
| 6.261194158604208 | 8.09 | 5.714 | 4.661 |
| 6.264335751257797 | 8.093 | 5.717 | 4.664 |
| 6.267477343911387 | 8.096 | 5.72 | 4.668 |
| 6.270618936564976 | 8.099 | 5.723 | 4.671 |
| 6.273760529218566 | 8.102 | 5.726 | 4.674 |
| 6.276902121872155 | 8.105 | 5.729 | 4.677 |
| 6.280043714525745 | 8.108 | 5.733 | 4.68 |
| 6.283185307179335 | 8.112 | 5.736 | 4.683 |